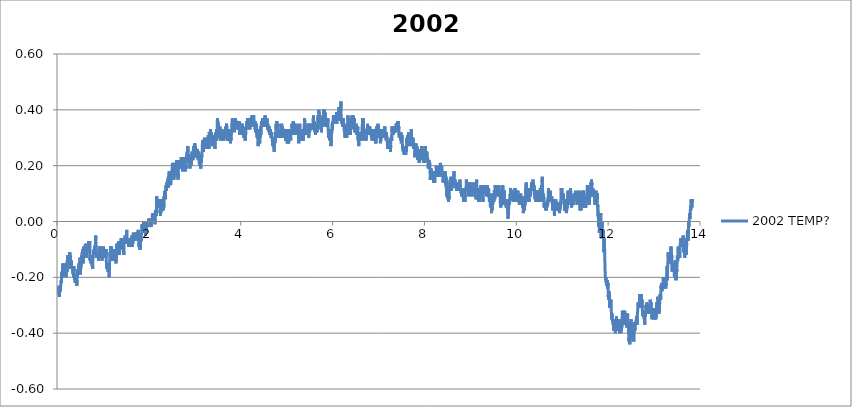
| Category | 2002 TEMP? |
|---|---|
| 0.01620481575 | -0.24 |
| 0.019264157416666667 | -0.25 |
| 0.022323499055555557 | -0.25 |
| 0.025382562916666667 | -0.25 |
| 0.028442737944444445 | -0.24 |
| 0.03150207961111111 | -0.25 |
| 0.03456142125 | -0.26 |
| 0.03762076291666666 | -0.25 |
| 0.040680104555555555 | -0.25 |
| 0.04373944622222222 | -0.23 |
| 0.04679878786111111 | -0.25 |
| 0.04985785172222222 | -0.27 |
| 0.05291747116666667 | -0.26 |
| 0.055977090611111106 | -0.25 |
| 0.05903643225 | -0.24 |
| 0.062096329500000005 | -0.24 |
| 0.0651553933611111 | -0.25 |
| 0.0682155683888889 | -0.24 |
| 0.07127546561111112 | -0.25 |
| 0.07433452947222222 | -0.25 |
| 0.07739387113888889 | -0.25 |
| 0.08045349058333334 | -0.23 |
| 0.08351283222222222 | -0.23 |
| 0.0865721738888889 | -0.23 |
| 0.08963123775 | -0.23 |
| 0.09269085719444445 | -0.21 |
| 0.09575019883333334 | -0.22 |
| 0.09880926269444444 | -0.21 |
| 0.10186999330555556 | -0.19 |
| 0.10492933497222222 | -0.2 |
| 0.10798839880555555 | -0.18 |
| 0.11104774047222221 | -0.19 |
| 0.11410735991666666 | -0.2 |
| 0.11716781274999999 | -0.18 |
| 0.12022715438888888 | -0.19 |
| 0.12328677383333334 | -0.19 |
| 0.12634611547222221 | -0.16 |
| 0.12940545713888887 | -0.15 |
| 0.132464521 | -0.17 |
| 0.13552441822222222 | -0.16 |
| 0.13858375988888888 | -0.18 |
| 0.1416431015277778 | -0.18 |
| 0.14470244319444445 | -0.18 |
| 0.14776178483333335 | -0.16 |
| 0.15082112649999999 | -0.17 |
| 0.15388157930555554 | -0.18 |
| 0.15694064316666667 | -0.17 |
| 0.15999998483333333 | -0.18 |
| 0.1630604376388889 | -0.19 |
| 0.16611977930555558 | -0.17 |
| 0.16917884316666668 | -0.16 |
| 0.17223790700000002 | -0.17 |
| 0.17529752644444443 | -0.16 |
| 0.1783568681111111 | -0.16 |
| 0.18141593197222222 | -0.16 |
| 0.18447527361111113 | -0.15 |
| 0.18753461527777776 | -0.18 |
| 0.1905936791111111 | -0.17 |
| 0.19365274297222224 | -0.16 |
| 0.19671264022222223 | -0.2 |
| 0.19977198186111111 | -0.17 |
| 0.20283104572222224 | -0.15 |
| 0.20589010958333334 | -0.17 |
| 0.20894945125 | -0.18 |
| 0.21200934847222222 | -0.16 |
| 0.21506924572222222 | -0.15 |
| 0.21812969852777778 | -0.18 |
| 0.22118904019444444 | -0.16 |
| 0.22424865963888888 | -0.14 |
| 0.22730800127777778 | -0.15 |
| 0.23036706513888888 | -0.13 |
| 0.23342696238888888 | -0.14 |
| 0.2364863040277778 | -0.13 |
| 0.2395453678888889 | -0.12 |
| 0.24260498733333333 | -0.14 |
| 0.2456643289722222 | -0.14 |
| 0.2487236706388889 | -0.15 |
| 0.2517830122777778 | -0.15 |
| 0.2548429095277778 | -0.14 |
| 0.25790225116666665 | -0.12 |
| 0.2609618706111111 | -0.14 |
| 0.2640209344722222 | -0.14 |
| 0.2670802761388889 | -0.15 |
| 0.27013934 | -0.15 |
| 0.2731992372222222 | -0.14 |
| 0.2762583010833333 | -0.15 |
| 0.27931792052777776 | -0.11 |
| 0.2823772621666667 | -0.14 |
| 0.2854374372222222 | -0.14 |
| 0.2884970566666667 | -0.12 |
| 0.2915566761111111 | -0.12 |
| 0.29461657333333335 | -0.17 |
| 0.2976756371944444 | -0.16 |
| 0.30073497883333333 | -0.14 |
| 0.3037940426944445 | -0.16 |
| 0.3068533843611111 | -0.17 |
| 0.309912726 | -0.14 |
| 0.31297429 | -0.14 |
| 0.31604002091666666 | -0.16 |
| 0.3190996403611111 | -0.16 |
| 0.3221592598055556 | -0.16 |
| 0.32521887925 | -0.16 |
| 0.3282796098611111 | -0.16 |
| 0.3313403404722222 | -0.16 |
| 0.33440023772222227 | -0.17 |
| 0.3374601349722222 | -0.17 |
| 0.34052086558333333 | -0.16 |
| 0.34358131841666667 | -0.18 |
| 0.3466417712222222 | -0.18 |
| 0.3497011128888889 | -0.18 |
| 0.3527632324722222 | -0.19 |
| 0.3558228519166667 | -0.18 |
| 0.35888330475 | -0.19 |
| 0.36194570211111116 | -0.2 |
| 0.36501421097222225 | -0.17 |
| 0.36807605275 | -0.16 |
| 0.37114261705555557 | -0.18 |
| 0.3742025142777778 | -0.19 |
| 0.3772626893055555 | -0.19 |
| 0.38032453111111114 | -0.2 |
| 0.3833844283333333 | -0.19 |
| 0.38644543675 | -0.2 |
| 0.38950700075 | -0.21 |
| 0.3925688425555556 | -0.2 |
| 0.39562985097222225 | -0.21 |
| 0.3986961374722222 | -0.22 |
| 0.40175603469444443 | -0.19 |
| 0.40481593194444443 | -0.2 |
| 0.4078777737222222 | -0.22 |
| 0.41093878213888885 | -0.2 |
| 0.4139986793888889 | -0.21 |
| 0.41705913219444446 | -0.2 |
| 0.42011875163888884 | -0.2 |
| 0.42317809330555556 | -0.21 |
| 0.42623743494444444 | -0.2 |
| 0.4292970543888889 | -0.23 |
| 0.4323566738333333 | -0.23 |
| 0.43541712666666665 | -0.21 |
| 0.43847674611111115 | -0.2 |
| 0.4415388656944444 | -0.19 |
| 0.4445984851388889 | -0.2 |
| 0.44765782680555555 | -0.18 |
| 0.4507188352222222 | -0.19 |
| 0.45378539949999996 | -0.18 |
| 0.4568447411388889 | -0.17 |
| 0.4599040828055555 | -0.17 |
| 0.46296370225 | -0.18 |
| 0.46602415505555556 | -0.17 |
| 0.4690837745 | -0.17 |
| 0.4721433939722222 | -0.16 |
| 0.4752024578055556 | -0.16 |
| 0.4782617994722222 | -0.15 |
| 0.48132225230555553 | -0.18 |
| 0.48438187175 | -0.18 |
| 0.48744093558333335 | -0.17 |
| 0.4905005550277778 | -0.17 |
| 0.49355989669444444 | -0.14 |
| 0.49661896055555554 | -0.14 |
| 0.4996791355833333 | -0.14 |
| 0.5027387550277778 | -0.13 |
| 0.5057980966666666 | -0.16 |
| 0.5088577161111111 | -0.19 |
| 0.5119170577777777 | -0.16 |
| 0.5149763994166666 | -0.17 |
| 0.5180357410833333 | -0.15 |
| 0.5210950827222223 | -0.16 |
| 0.5241549799722222 | -0.14 |
| 0.5272143216111111 | -0.13 |
| 0.5302736632777778 | -0.14 |
| 0.5333330049166667 | -0.12 |
| 0.5363920687777778 | -0.13 |
| 0.5394514104166667 | -0.14 |
| 0.5425110298611111 | -0.13 |
| 0.5455706493055555 | -0.12 |
| 0.5486299909722222 | -0.11 |
| 0.5516904437777778 | -0.11 |
| 0.5547497854444444 | -0.12 |
| 0.5578096826666666 | -0.11 |
| 0.5608693021111111 | -0.1 |
| 0.5639291993611111 | -0.13 |
| 0.5669888188055555 | -0.14 |
| 0.5700489938333333 | -0.15 |
| 0.5731083355 | -0.12 |
| 0.5761676771388888 | -0.11 |
| 0.5792275743888889 | -0.09 |
| 0.5822869160277778 | -0.1 |
| 0.5853487578333333 | -0.1 |
| 0.5884086550555556 | -0.12 |
| 0.5914679967222223 | -0.13 |
| 0.5945273383611112 | -0.12 |
| 0.5975869578055555 | -0.13 |
| 0.60064657725 | -0.11 |
| 0.6037061966944445 | -0.11 |
| 0.6067652605555556 | -0.12 |
| 0.60982488 | -0.1 |
| 0.6128842216388889 | -0.09 |
| 0.6159438410833333 | -0.08 |
| 0.6190029049444444 | -0.08 |
| 0.6220628021944444 | -0.09 |
| 0.6251221438333333 | -0.11 |
| 0.6281820410833333 | -0.09 |
| 0.6312411049444444 | -0.11 |
| 0.634300724388889 | -0.09 |
| 0.6373608994166666 | -0.13 |
| 0.6404199632777777 | -0.11 |
| 0.6434793049166666 | -0.1 |
| 0.6465386465833333 | -0.08 |
| 0.6495990993888889 | -0.08 |
| 0.6526584410555555 | -0.08 |
| 0.6557175049166666 | -0.08 |
| 0.6587768465555556 | -0.09 |
| 0.6618359104166667 | -0.09 |
| 0.6648949742777778 | -0.09 |
| 0.6679545937222223 | -0.1 |
| 0.6710139353611111 | -0.11 |
| 0.6740732770277779 | -0.11 |
| 0.6771323408888889 | -0.11 |
| 0.6801922381111111 | -0.08 |
| 0.6832515797777777 | -0.09 |
| 0.6863109214166666 | -0.07 |
| 0.6893699852777778 | -0.11 |
| 0.6924296047222221 | -0.1 |
| 0.6954892241666667 | -0.09 |
| 0.6985499547777778 | -0.09 |
| 0.7016106854166666 | -0.08 |
| 0.7046700270555555 | -0.11 |
| 0.7077302020833333 | -0.1 |
| 0.7107903771111111 | -0.07 |
| 0.7138497187777778 | -0.11 |
| 0.7169090604166667 | -0.11 |
| 0.7199684020833333 | -0.14 |
| 0.7230277437222222 | -0.12 |
| 0.7260868075833333 | -0.12 |
| 0.7291461492222222 | -0.14 |
| 0.7322060464722222 | -0.13 |
| 0.7352651103333334 | -0.14 |
| 0.7383244519722223 | -0.15 |
| 0.741383793638889 | -0.13 |
| 0.7444439686666667 | -0.14 |
| 0.7475030325277777 | -0.14 |
| 0.7505623741666667 | -0.14 |
| 0.7536222714166667 | -0.15 |
| 0.756681890861111 | -0.15 |
| 0.7597412324999999 | -0.13 |
| 0.7628005741666666 | -0.14 |
| 0.765859638 | -0.13 |
| 0.7689189796666668 | -0.16 |
| 0.7719780435277778 | -0.14 |
| 0.7750371073888889 | -0.17 |
| 0.7780964490277777 | -0.16 |
| 0.7811560684722223 | -0.14 |
| 0.7842151323333333 | -0.13 |
| 0.7872805854444445 | -0.13 |
| 0.7903402048888889 | -0.11 |
| 0.7934001021111111 | -0.11 |
| 0.7964627773055555 | -0.11 |
| 0.7995229523333333 | -0.12 |
| 0.8025836829444445 | -0.12 |
| 0.8056483026944444 | -0.12 |
| 0.8087073665277777 | -0.1 |
| 0.8117678193611111 | -0.11 |
| 0.8148282721944444 | -0.1 |
| 0.8179112263055556 | -0.09 |
| 0.8210047365833334 | -0.1 |
| 0.8240715786666667 | -0.09 |
| 0.8271378651388889 | -0.09 |
| 0.8302341533611111 | -0.09 |
| 0.8332948839722222 | -0.09 |
| 0.8363586703333333 | -0.09 |
| 0.8394296793055556 | -0.08 |
| 0.8424995771111111 | -0.05 |
| 0.8455630856666667 | -0.07 |
| 0.8486377059722222 | -0.07 |
| 0.8517070481944444 | -0.08 |
| 0.8547772238055555 | -0.13 |
| 0.8578462882222223 | -0.13 |
| 0.8609147970833333 | -0.12 |
| 0.8639855282777777 | -0.13 |
| 0.8670629264999999 | -0.12 |
| 0.8701283796111111 | -0.12 |
| 0.8731957772777778 | -0.12 |
| 0.8762559523055555 | -0.11 |
| 0.8793405731944444 | -0.12 |
| 0.882412971138889 | -0.13 |
| 0.8854831467500001 | -0.11 |
| 0.888550266611111 | -0.12 |
| 0.8916207200277778 | -0.13 |
| 0.89468533975 | -0.13 |
| 0.8977502372777778 | -0.12 |
| 0.9008168015555555 | -0.12 |
| 0.9038803101111111 | -0.14 |
| 0.9069743759722222 | -0.12 |
| 0.9100401068888888 | -0.12 |
| 0.9131016708888888 | -0.13 |
| 0.9161707353055556 | -0.13 |
| 0.9192364662222222 | -0.13 |
| 0.9223096975555556 | -0.1 |
| 0.9253823733055555 | -0.11 |
| 0.92844671525 | -0.09 |
| 0.9315141129166666 | -0.1 |
| 0.9346031784722223 | -0.09 |
| 0.93768391025 | -0.11 |
| 0.9407485299722222 | -0.1 |
| 0.9438209279166666 | -0.13 |
| 0.9468924925 | -0.13 |
| 0.9499568344444445 | -0.13 |
| 0.9530231209166666 | -0.11 |
| 0.9560907963888889 | -0.12 |
| 0.9591590274444444 | -0.09 |
| 0.9622339255277779 | -0.11 |
| 0.9653029899722223 | -0.12 |
| 0.9683670541111111 | -0.12 |
| 0.9714330628055556 | -0.12 |
| 0.9744946268055557 | -0.11 |
| 0.9775598021111112 | -0.13 |
| 0.9806277553888889 | -0.14 |
| 0.9836982087777778 | -0.13 |
| 0.9867617173333334 | -0.13 |
| 0.9898296705833333 | -0.12 |
| 0.9929040130833333 | -0.11 |
| 0.9959686328333333 | -0.12 |
| 0.9990457532777778 | -0.12 |
| 1.0021114841666665 | -0.1 |
| 1.0051797152222222 | -0.09 |
| 1.0082732255 | -0.09 |
| 1.0113453456666666 | -0.09 |
| 1.0144141323055555 | -0.09 |
| 1.017506531388889 | -0.1 |
| 1.0205739290555556 | -0.11 |
| 1.0236579943333333 | -0.11 |
| 1.02672372525 | -0.11 |
| 1.029811401861111 | -0.11 |
| 1.032892967 | -0.12 |
| 1.0359750877222222 | -0.1 |
| 1.0390497080277779 | -0.12 |
| 1.0421309953888889 | -0.13 |
| 1.0452078380277778 | -0.13 |
| 1.0482696798333333 | -0.12 |
| 1.0513426333611111 | -0.13 |
| 1.0544441996666667 | -0.11 |
| 1.05753659875 | -0.12 |
| 1.0606017740833333 | -0.1 |
| 1.0636813946666666 | -0.1 |
| 1.0667543481944444 | -0.11 |
| 1.0698203569166667 | -0.1 |
| 1.072900810861111 | -0.13 |
| 1.0759909876111111 | -0.15 |
| 1.079068385861111 | -0.16 |
| 1.0821452285 | -0.15 |
| 1.0852242935 | -0.15 |
| 1.0883314156666666 | -0.17 |
| 1.0913993689166668 | -0.15 |
| 1.0944737114444445 | -0.16 |
| 1.0975466649722223 | -0.15 |
| 1.1006465645 | -0.16 |
| 1.1037395191944444 | -0.16 |
| 1.1068299737222222 | -0.17 |
| 1.1099054274166666 | -0.18 |
| 1.1130056047222223 | -0.16 |
| 1.1160841141388889 | -0.15 |
| 1.1191570676944445 | -0.17 |
| 1.1222719680833333 | -0.18 |
| 1.1253426992777777 | -0.18 |
| 1.1284198197222222 | -0.17 |
| 1.1314986069166666 | -0.18 |
| 1.1345998954166667 | -0.2 |
| 1.1376775714444445 | -0.19 |
| 1.1407677481944445 | -0.17 |
| 1.143864592 | -0.16 |
| 1.1469633803333332 | -0.14 |
| 1.150034667111111 | -0.12 |
| 1.1530981756666667 | -0.11 |
| 1.1561677956944443 | -0.11 |
| 1.1592404714444446 | -0.11 |
| 1.1623070357222223 | -0.12 |
| 1.1653749889722222 | -0.09 |
| 1.1684454423888888 | -0.1 |
| 1.17151728475 | -0.1 |
| 1.1745807933055554 | -0.09 |
| 1.1776495799444446 | -0.1 |
| 1.1807283671388888 | -0.09 |
| 1.183796876 | -0.09 |
| 1.1868745520277777 | -0.09 |
| 1.1899419496944446 | -0.09 |
| 1.1930087917777779 | -0.1 |
| 1.1960803563333333 | -0.1 |
| 1.199141086972222 | -0.1 |
| 1.2022040399166667 | -0.13 |
| 1.2052689374444445 | -0.13 |
| 1.2083402242222223 | -0.13 |
| 1.2114126221944443 | -0.14 |
| 1.2144758529444446 | -0.14 |
| 1.2175410282777777 | -0.12 |
| 1.2206195376666666 | -0.13 |
| 1.2236849907777776 | -0.11 |
| 1.226747110388889 | -0.12 |
| 1.2298114523055557 | -0.14 |
| 1.2328738496944445 | -0.13 |
| 1.2359351359166666 | -0.13 |
| 1.2390130897222222 | -0.13 |
| 1.2420793762222222 | -0.13 |
| 1.2451409402222222 | -0.12 |
| 1.2482086156944443 | -0.13 |
| 1.25127212425 | -0.1 |
| 1.2543372995555557 | -0.12 |
| 1.2574005303333333 | -0.12 |
| 1.2604654278333334 | -0.12 |
| 1.2635375480000002 | -0.13 |
| 1.2666024455277778 | -0.13 |
| 1.2696676208333333 | -0.13 |
| 1.2727280736666666 | -0.11 |
| 1.27579491575 | -0.12 |
| 1.2788553685833333 | -0.12 |
| 1.2819174881666666 | -0.15 |
| 1.2849804411388888 | -0.13 |
| 1.2880447830833333 | -0.14 |
| 1.2911080138333333 | -0.14 |
| 1.2941693000277776 | -0.12 |
| 1.297237808888889 | -0.11 |
| 1.3002988173055554 | -0.08 |
| 1.3033606590833333 | -0.08 |
| 1.3064227786666667 | -0.11 |
| 1.3094862872222222 | -0.11 |
| 1.3125764639722222 | -0.12 |
| 1.315646917388889 | -0.11 |
| 1.3187112593055557 | -0.11 |
| 1.3217733789166666 | -0.11 |
| 1.3248496659722224 | -0.12 |
| 1.3279128967222222 | -0.12 |
| 1.3309814055833333 | -0.12 |
| 1.334059081611111 | -0.09 |
| 1.3371187010555556 | -0.07 |
| 1.34018470975 | -0.09 |
| 1.34324627375 | -0.09 |
| 1.3463556182499998 | -0.08 |
| 1.3494169044722222 | -0.09 |
| 1.3524768016944444 | -0.09 |
| 1.35555447775 | -0.12 |
| 1.358627986861111 | -0.11 |
| 1.3617020515833331 | -0.07 |
| 1.3647708382222221 | -0.08 |
| 1.3678396248611113 | -0.08 |
| 1.370907578111111 | -0.08 |
| 1.373972475638889 | -0.09 |
| 1.3770398733055558 | -0.1 |
| 1.38009949275 | -0.09 |
| 1.3831646680555556 | -0.07 |
| 1.3862278988333332 | -0.08 |
| 1.3892891850277778 | -0.07 |
| 1.392348804472222 | -0.07 |
| 1.395409812888889 | -0.08 |
| 1.39852137975 | -0.06 |
| 1.4015904441666667 | -0.08 |
| 1.4046672868333334 | -0.08 |
| 1.4077335733333334 | -0.07 |
| 1.4108006931944443 | -0.08 |
| 1.41386420175 | -0.07 |
| 1.4169260435555555 | -0.09 |
| 1.419986496361111 | -0.08 |
| 1.4230477825833332 | -0.06 |
| 1.4261240696388888 | -0.08 |
| 1.4291925784722221 | -0.06 |
| 1.432258864972222 | -0.07 |
| 1.4353254292777777 | -0.09 |
| 1.4383958826666667 | -0.09 |
| 1.4414757810555556 | -0.09 |
| 1.4445415119444445 | -0.11 |
| 1.447609743 | -0.12 |
| 1.450673807138889 | -0.11 |
| 1.4537331488055556 | -0.12 |
| 1.4567994352777778 | -0.11 |
| 1.45986238825 | -0.07 |
| 1.462932008277778 | -0.08 |
| 1.4659946834444446 | -0.08 |
| 1.4690679147777779 | -0.08 |
| 1.4721311455555555 | -0.08 |
| 1.4751918761666667 | -0.06 |
| 1.4782526067777777 | -0.06 |
| 1.4813763965555555 | -0.06 |
| 1.4844396273333333 | -0.05 |
| 1.4875009135277777 | -0.06 |
| 1.4905641443055555 | -0.06 |
| 1.4936376534166667 | -0.06 |
| 1.4967033843333333 | -0.07 |
| 1.499776337861111 | -0.06 |
| 1.5028492914166665 | -0.06 |
| 1.505911411 | -0.07 |
| 1.5089813088055555 | -0.07 |
| 1.5120500954444445 | -0.06 |
| 1.5151147151666666 | -0.06 |
| 1.51817683475 | -0.03 |
| 1.5212372875833333 | -0.04 |
| 1.5242988515833333 | -0.04 |
| 1.5273584710277777 | -0.06 |
| 1.5304194794444446 | -0.06 |
| 1.5334807656388887 | -0.06 |
| 1.5365401073055556 | -0.08 |
| 1.5396027824722223 | -0.08 |
| 1.5426624019166666 | -0.06 |
| 1.5457264660555554 | -0.06 |
| 1.5487919191666666 | -0.06 |
| 1.5518590390555556 | -0.07 |
| 1.5549247699444444 | -0.06 |
| 1.5579846671944446 | -0.06 |
| 1.5610467867777778 | -0.09 |
| 1.5641205736944443 | -0.09 |
| 1.5671824155 | -0.08 |
| 1.5702423127222223 | -0.09 |
| 1.5733049879166667 | -0.08 |
| 1.5763643295555554 | -0.08 |
| 1.5794250601666666 | -0.08 |
| 1.5824849574166668 | -0.09 |
| 1.5855451324444445 | -0.09 |
| 1.588609474388889 | -0.09 |
| 1.5916727051388888 | -0.09 |
| 1.5947353803333333 | -0.09 |
| 1.5977974999166669 | -0.09 |
| 1.6008579527500002 | -0.09 |
| 1.6039203501111112 | -0.07 |
| 1.6069816363333334 | -0.09 |
| 1.610041811361111 | -0.09 |
| 1.6131008752222222 | -0.08 |
| 1.616163550388889 | -0.07 |
| 1.6192253921944444 | -0.07 |
| 1.6222955677777777 | -0.06 |
| 1.6253549094444444 | -0.06 |
| 1.6284303631111112 | -0.07 |
| 1.6314899825555556 | -0.05 |
| 1.6345507131944443 | -0.06 |
| 1.6376106104166666 | -0.07 |
| 1.6406707854444444 | -0.09 |
| 1.643730127111111 | -0.07 |
| 1.6467903021388888 | -0.08 |
| 1.6498529773055555 | -0.08 |
| 1.6529128745555555 | -0.08 |
| 1.6559774942777776 | -0.07 |
| 1.65904044725 | -0.05 |
| 1.6621000666944443 | -0.04 |
| 1.6651688533333333 | -0.05 |
| 1.6682365288055556 | -0.06 |
| 1.6713150382222224 | -0.05 |
| 1.6743749354444446 | -0.05 |
| 1.6774356660555554 | -0.06 |
| 1.6804950077222223 | -0.06 |
| 1.6835546271666666 | -0.05 |
| 1.6866184135 | -0.05 |
| 1.6896847 | -0.06 |
| 1.69274459725 | -0.05 |
| 1.6958050500555555 | -0.04 |
| 1.6988666140555557 | -0.07 |
| 1.7019287336666666 | -0.06 |
| 1.7049889086944445 | -0.06 |
| 1.7080493615277779 | -0.05 |
| 1.7111089809722222 | -0.05 |
| 1.714177212 | -0.06 |
| 1.7172376648333334 | -0.04 |
| 1.7202972842777777 | -0.05 |
| 1.723358570472222 | -0.06 |
| 1.7264223568333334 | -0.05 |
| 1.7294839208333332 | -0.04 |
| 1.7325443736666666 | -0.05 |
| 1.7356037153055557 | -0.05 |
| 1.7386691684166666 | -0.05 |
| 1.7417326769722223 | -0.06 |
| 1.7447934076111111 | -0.04 |
| 1.7478541382222224 | -0.05 |
| 1.75091431325 | -0.04 |
| 1.7539739326944443 | -0.04 |
| 1.757035218888889 | -0.04 |
| 1.7600948383333332 | -0.05 |
| 1.763155013388889 | -0.05 |
| 1.766217132972222 | -0.06 |
| 1.7692825860833332 | -0.03 |
| 1.7723613732777777 | -0.06 |
| 1.7754207149444445 | -0.07 |
| 1.7784833901111112 | -0.05 |
| 1.78154745425 | -0.07 |
| 1.7846098516388889 | -0.09 |
| 1.7876769715 | -0.08 |
| 1.7907413134444445 | -0.08 |
| 1.7938050998055557 | -0.08 |
| 1.7968841648055556 | -0.07 |
| 1.7999443398333335 | -0.1 |
| 1.8030042370555557 | -0.09 |
| 1.8060644121111111 | -0.09 |
| 1.8091287540277778 | -0.1 |
| 1.8122169862222222 | -0.09 |
| 1.815276327888889 | -0.07 |
| 1.8183365029166667 | -0.09 |
| 1.82139695575 | -0.07 |
| 1.8244587975277777 | -0.06 |
| 1.8275203615277777 | -0.06 |
| 1.8305805365555554 | -0.07 |
| 1.8336418227777778 | -0.06 |
| 1.8367042201388888 | -0.05 |
| 1.8397696732500002 | -0.05 |
| 1.8428331818055554 | -0.04 |
| 1.8458947458055557 | -0.02 |
| 1.8489554764444445 | -0.02 |
| 1.8520273188055556 | -0.01 |
| 1.855118884527778 | -0.01 |
| 1.8581798929444444 | -0.02 |
| 1.861240067972222 | -0.01 |
| 1.8643007985833333 | -0.01 |
| 1.8673623625833333 | -0.03 |
| 1.8704247599722224 | -0.04 |
| 1.8734918798333333 | -0.04 |
| 1.8765512215 | -0.03 |
| 1.879620008138889 | -0.03 |
| 1.8826857390277778 | -0.03 |
| 1.8857459140555557 | 0 |
| 1.888810256 | 0 |
| 1.8918704310277779 | -0.01 |
| 1.894933384 | -0.02 |
| 1.898012449 | -0.03 |
| 1.901074846388889 | -0.04 |
| 1.9041358548055556 | -0.03 |
| 1.9071982521666668 | -0.04 |
| 1.9102603717777777 | -0.02 |
| 1.913319991222222 | -0.03 |
| 1.9163879444722223 | -0.01 |
| 1.9194481195000002 | -0.02 |
| 1.92250801675 | -0.04 |
| 1.9255712475 | -0.05 |
| 1.9286333670833333 | -0.04 |
| 1.9316988201944443 | -0.03 |
| 1.934759828611111 | -0.02 |
| 1.937819725861111 | -0.03 |
| 1.9408860123333334 | -0.04 |
| 1.9439459095833334 | -0.04 |
| 1.9470099737222222 | -0.01 |
| 1.9500743156666667 | -0.02 |
| 1.9531350462777777 | -0.01 |
| 1.956195776888889 | -0.01 |
| 1.9592559519444444 | -0.02 |
| 1.962317793722222 | 0 |
| 1.9653790799444444 | 0 |
| 1.9684392549722223 | -0.02 |
| 1.97149943 | -0.02 |
| 1.9745584938611112 | 0 |
| 1.9776236691666669 | 0 |
| 1.9806843997777777 | -0.01 |
| 1.9837442970277779 | -0.01 |
| 1.9868041942777779 | 0 |
| 1.9898732586944445 | -0.01 |
| 1.9929409341666666 | 0 |
| 1.9960005536111112 | 0.01 |
| 1.9990648955277779 | -0.02 |
| 2.002144516138889 | -0.01 |
| 2.0052060801388887 | 0 |
| 2.008267644138889 | 0 |
| 2.0113289303333333 | 0.01 |
| 2.0143893831666664 | 0 |
| 2.0174495581944445 | 0 |
| 2.0205094554444445 | -0.01 |
| 2.0235685192777777 | 0 |
| 2.0266411950277776 | 0 |
| 2.0297088705 | 0.01 |
| 2.0327690455277776 | 0 |
| 2.0358292205555557 | 0 |
| 2.0388941180833333 | 0 |
| 2.0419554043055554 | -0.01 |
| 2.0450155793333336 | 0 |
| 2.048078810083333 | 0 |
| 2.0511398185 | -0.02 |
| 2.0542008269166665 | 0 |
| 2.05726127975 | -0.01 |
| 2.0603245105 | 0 |
| 2.0633994085833334 | 0 |
| 2.066459028027778 | 0 |
| 2.069520869833333 | 0 |
| 2.0725807670833336 | 0.01 |
| 2.0756417755 | 0.01 |
| 2.0787013949444444 | 0.03 |
| 2.0817757374444446 | 0.03 |
| 2.084835079083333 | 0 |
| 2.0878991432222223 | 0 |
| 2.0909598738611113 | 0.01 |
| 2.0940203266666666 | 0.01 |
| 2.0970796683333335 | 0.02 |
| 2.1001448436388888 | 0.01 |
| 2.103211963527778 | 0.01 |
| 2.1062874171944443 | 0.01 |
| 2.1093475922500002 | 0.03 |
| 2.1124066560833334 | 0 |
| 2.1154671089166666 | 0.03 |
| 2.1185381179166667 | 0.02 |
| 2.121608849083333 | 0.02 |
| 2.124671246472222 | 0.02 |
| 2.1277330882777776 | 0.03 |
| 2.1308018749166666 | 0.01 |
| 2.133861494361111 | -0.01 |
| 2.1369241695277776 | 0.02 |
| 2.1399865669166664 | 0.03 |
| 2.1430464641388887 | 0.04 |
| 2.1461077503611112 | 0.02 |
| 2.1491698699444446 | 0.02 |
| 2.1522392121666667 | 0.03 |
| 2.1552988316111112 | 0.03 |
| 2.158363729138889 | 0.04 |
| 2.161423070777778 | 0.02 |
| 2.1644824124444444 | 0.05 |
| 2.1675417540833335 | 0.07 |
| 2.17060109575 | 0.09 |
| 2.1736640486944445 | 0.06 |
| 2.1767356132777778 | 0.07 |
| 2.1797946771388887 | 0.07 |
| 2.182861519222222 | 0.08 |
| 2.1859219720555556 | 0.08 |
| 2.1889868695555554 | 0.07 |
| 2.1920492669444442 | 0.06 |
| 2.1951108309444445 | 0.07 |
| 2.198171005972222 | 0.06 |
| 2.201230069833333 | 0.06 |
| 2.2042955229444443 | 0.08 |
| 2.2073562535555555 | 0.06 |
| 2.2104178175555553 | 0.07 |
| 2.213478270388889 | 0.05 |
| 2.216538167638889 | 0.07 |
| 2.219602231777778 | 0.06 |
| 2.222669351638889 | 0.06 |
| 2.2257311934444446 | 0.08 |
| 2.2287916462777777 | 0.05 |
| 2.2318604329166667 | 0.06 |
| 2.2349253304166665 | 0.06 |
| 2.237988283388889 | 0.07 |
| 2.2410590145833336 | 0.06 |
| 2.2441236343333335 | 0.03 |
| 2.2471874206666667 | 0.03 |
| 2.250250095833333 | 0.04 |
| 2.2533113820555557 | 0.02 |
| 2.2563935027777777 | 0.04 |
| 2.2594531222222223 | 0.03 |
| 2.262512741666667 | 0.05 |
| 2.2655765280277778 | 0.06 |
| 2.2686414255555554 | 0.08 |
| 2.2717021561666666 | 0.08 |
| 2.274765664722222 | 0.06 |
| 2.277826117555555 | 0.06 |
| 2.2808943485833333 | 0.07 |
| 2.2839534124444447 | 0.05 |
| 2.2870133096944443 | 0.04 |
| 2.2900918191111113 | 0.05 |
| 2.293151994138889 | 0.05 |
| 2.2962121691666666 | 0.05 |
| 2.299273733166667 | 0.06 |
| 2.3023350193888885 | 0.04 |
| 2.305397138972222 | 0.06 |
| 2.308457314 | 0.04 |
| 2.311521933722222 | 0.07 |
| 2.3145846088888886 | 0.05 |
| 2.3176467285 | 0.05 |
| 2.320706625722222 | 0.07 |
| 2.323765967388889 | 0.05 |
| 2.326838920916667 | 0.06 |
| 2.3299004849166667 | 0.09 |
| 2.3329812166944444 | 0.08 |
| 2.3360458364166665 | 0.08 |
| 2.339108789388889 | 0.08 |
| 2.3421681310277775 | 0.08 |
| 2.3452271948888885 | 0.08 |
| 2.348287647722222 | 0.11 |
| 2.3513536564166664 | 0.11 |
| 2.3544163315833333 | 0.1 |
| 2.3574792845555557 | 0.1 |
| 2.360538626222222 | 0.08 |
| 2.363599634611111 | 0.11 |
| 2.3666606430277777 | 0.11 |
| 2.369723318222222 | 0.12 |
| 2.372783215444444 | 0.13 |
| 2.3758425571111115 | 0.13 |
| 2.3789024543333337 | 0.13 |
| 2.381962073777778 | 0.13 |
| 2.385026137916667 | 0.11 |
| 2.3880935355833333 | 0.13 |
| 2.391153155027778 | 0.12 |
| 2.3942133300833333 | 0.12 |
| 2.3972735051111114 | 0.14 |
| 2.4003334023333336 | 0.12 |
| 2.4033963553055555 | 0.13 |
| 2.406459308277778 | 0.13 |
| 2.409520594472222 | 0.15 |
| 2.412581880694445 | 0.15 |
| 2.4156490005555558 | 0.15 |
| 2.4187138980833334 | 0.14 |
| 2.4217768510555557 | 0.12 |
| 2.4248398040277777 | 0.16 |
| 2.4279216469722225 | 0.16 |
| 2.4309871000833336 | 0.15 |
| 2.434053664361111 | 0.16 |
| 2.4371141171944446 | 0.16 |
| 2.4401745700277777 | 0.17 |
| 2.44323446725 | 0.18 |
| 2.4462965868333333 | 0.16 |
| 2.4493567618611114 | 0.16 |
| 2.452416659111111 | 0.15 |
| 2.455481556638889 | 0.15 |
| 2.4585458985833335 | 0.15 |
| 2.4616049624166667 | 0.16 |
| 2.464685138611111 | 0.15 |
| 2.467746424805555 | 0.14 |
| 2.4708088221944444 | 0.14 |
| 2.4738681638333335 | 0.13 |
| 2.47692917225 | 0.13 |
| 2.479991291833333 | 0.16 |
| 2.4830581339166664 | 0.15 |
| 2.486118031166667 | 0.16 |
| 2.4891829286944445 | 0.15 |
| 2.4922422703333336 | 0.17 |
| 2.4953018897777777 | 0.18 |
| 2.498364287166667 | 0.18 |
| 2.5014277957222224 | 0.17 |
| 2.5044874151666665 | 0.18 |
| 2.507558146361111 | 0.18 |
| 2.5106222105000002 | 0.18 |
| 2.5136826633333333 | 0.21 |
| 2.5167464496666665 | 0.2 |
| 2.519819125416667 | 0.18 |
| 2.5228793004444445 | 0.19 |
| 2.5259411422499998 | 0.19 |
| 2.529001872861111 | 0.19 |
| 2.5320639924444444 | 0.16 |
| 2.5351247230833334 | 0.17 |
| 2.5381907317777777 | 0.18 |
| 2.5412500734166668 | 0.15 |
| 2.5443135819722222 | 0.16 |
| 2.547373757 | 0.18 |
| 2.5504369877777777 | 0.16 |
| 2.5534979961944444 | 0.19 |
| 2.5565581712222225 | 0.21 |
| 2.559621679777778 | 0.17 |
| 2.5626835215833332 | 0.18 |
| 2.565745363361111 | 0.17 |
| 2.5688083163333335 | 0.19 |
| 2.5718687691666666 | 0.18 |
| 2.574928666388889 | 0.17 |
| 2.5779902303888886 | 0.16 |
| 2.581052627777778 | 0.16 |
| 2.584111969416667 | 0.17 |
| 2.587173255638889 | 0.2 |
| 2.5902350974166666 | 0.17 |
| 2.593294439083333 | 0.19 |
| 2.5963573920555554 | 0.17 |
| 2.5994175670833335 | 0.19 |
| 2.6024780199166666 | 0.18 |
| 2.6055404172777776 | 0.22 |
| 2.608600314527778 | 0.19 |
| 2.6116635452777777 | 0.2 |
| 2.6147309429444445 | 0.19 |
| 2.617792229166667 | 0.18 |
| 2.6208579600555555 | 0.18 |
| 2.6239242465555557 | 0.19 |
| 2.626987477333333 | 0.19 |
| 2.6300473745555553 | 0.18 |
| 2.633107827388889 | 0.18 |
| 2.636168002416667 | 0.15 |
| 2.6392351223055552 | 0.17 |
| 2.6422961306944446 | 0.19 |
| 2.6453663063055557 | 0.2 |
| 2.648430092666667 | 0.2 |
| 2.6514911010833333 | 0.19 |
| 2.6545554429999996 | 0.2 |
| 2.65761534025 | 0.2 |
| 2.660674404111111 | 0.22 |
| 2.6637370792777775 | 0.19 |
| 2.6667972543055556 | 0.19 |
| 2.6698574293333333 | 0.19 |
| 2.6729173265833333 | 0.2 |
| 2.6759813907222223 | 0.21 |
| 2.679042676944445 | 0.2 |
| 2.682102574166667 | 0.2 |
| 2.6851688606666664 | 0.2 |
| 2.6882357027499997 | 0.19 |
| 2.691296988944444 | 0.21 |
| 2.6943577195833335 | 0.2 |
| 2.6974228948888888 | 0.2 |
| 2.700486125638889 | 0.2 |
| 2.7035457450833333 | 0.22 |
| 2.7066075868888886 | 0.23 |
| 2.709669150888889 | 0.2 |
| 2.712737104138889 | 0.21 |
| 2.7157995015277776 | 0.2 |
| 2.7188591209722226 | 0.2 |
| 2.7219240184999998 | 0.2 |
| 2.7249933607222223 | 0.2 |
| 2.7280554803055557 | 0.21 |
| 2.7311178776944445 | 0.18 |
| 2.734183886388889 | 0.21 |
| 2.7372443392222223 | 0.23 |
| 2.7403114590833337 | 0.22 |
| 2.7433744120555557 | 0.23 |
| 2.746450699111111 | 0.22 |
| 2.7495136520833334 | 0.22 |
| 2.752575771666667 | 0.22 |
| 2.7556381690555556 | 0.22 |
| 2.7587025109999996 | 0.22 |
| 2.761772964388889 | 0.21 |
| 2.7648325838333334 | 0.21 |
| 2.767893314444444 | 0.23 |
| 2.7709537672777778 | 0.21 |
| 2.7740150535 | 0.2 |
| 2.7770788398333335 | 0.22 |
| 2.780139014861111 | 0.18 |
| 2.783202801222222 | 0.18 |
| 2.7862649208055554 | 0.2 |
| 2.78932454025 | 0.19 |
| 2.7923872154166665 | 0.19 |
| 2.795449057222222 | 0.18 |
| 2.7985172882777776 | 0.18 |
| 2.8015791300555555 | 0.19 |
| 2.804646805527778 | 0.2 |
| 2.8077069805555555 | 0.19 |
| 2.8107702113055555 | 0.22 |
| 2.8138301085555555 | 0.22 |
| 2.8168900058055555 | 0.21 |
| 2.8199532365555555 | 0.22 |
| 2.8230511915277776 | 0.23 |
| 2.826115533472222 | 0.24 |
| 2.8291754306944443 | 0.24 |
| 2.832235050138889 | 0.23 |
| 2.8352988365 | 0.25 |
| 2.838358178138889 | 0.24 |
| 2.8414211311111113 | 0.23 |
| 2.844484361888889 | 0.23 |
| 2.8475573154166662 | 0.27 |
| 2.8506191572222224 | 0.25 |
| 2.853681832388889 | 0.25 |
| 2.8567556193055554 | 0.24 |
| 2.859816627722222 | 0.21 |
| 2.862887358916667 | 0.22 |
| 2.865948089527778 | 0.24 |
| 2.869008542361111 | 0.22 |
| 2.872068717388889 | 0.22 |
| 2.875130836972222 | 0.23 |
| 2.878191012 | 0.23 |
| 2.8812550761666667 | 0.24 |
| 2.8843188625 | 0.23 |
| 2.88737875975 | 0.21 |
| 2.8904522688611114 | 0.23 |
| 2.893512166111111 | 0.21 |
| 2.896572896722222 | 0.19 |
| 2.899634738527778 | 0.21 |
| 2.9027035251666664 | 0.2 |
| 2.9057673115 | 0.21 |
| 2.908830820055556 | 0.21 |
| 2.9118982177222223 | 0.23 |
| 2.9149642264166666 | 0.22 |
| 2.918025790416667 | 0.21 |
| 2.9210898545833333 | 0.2 |
| 2.9241533631388887 | 0.22 |
| 2.927241873111111 | 0.21 |
| 2.930330383111111 | 0.21 |
| 2.933400003111111 | 0.21 |
| 2.936462122694444 | 0.23 |
| 2.9395225755277776 | 0.25 |
| 2.942585806305556 | 0.25 |
| 2.945646259111111 | 0.25 |
| 2.9487106010555553 | 0.23 |
| 2.951780498861111 | 0.25 |
| 2.9548423406666666 | 0.24 |
| 2.9579091827500004 | 0.22 |
| 2.9609715801111114 | 0.22 |
| 2.9640334219166666 | 0.23 |
| 2.967097208277778 | 0.25 |
| 2.9701565499166667 | 0.25 |
| 2.9732195028888886 | 0.27 |
| 2.976280789083333 | 0.26 |
| 2.979340964111111 | 0.24 |
| 2.9824114175277776 | 0.26 |
| 2.985472148138889 | 0.27 |
| 2.9885331565555555 | 0.25 |
| 2.9915936093888886 | 0.27 |
| 2.99465434 | 0.25 |
| 2.997715904 | 0.25 |
| 3.0007771901944444 | 0.28 |
| 3.0038390319999997 | 0.25 |
| 3.006912541138889 | 0.25 |
| 3.0099729939444444 | 0.24 |
| 3.01306511525 | 0.25 |
| 3.016126401472222 | 0.27 |
| 3.0191957436944445 | 0.26 |
| 3.022257029888889 | 0.25 |
| 3.0253180383055556 | 0.24 |
| 3.0283812690555556 | 0.23 |
| 3.0314714458055554 | 0.24 |
| 3.034538010111111 | 0.23 |
| 3.0375970739722225 | 0.25 |
| 3.0406589157500004 | 0.25 |
| 3.043722702111111 | 0.23 |
| 3.046788155222222 | 0.25 |
| 3.0498502748055554 | 0.24 |
| 3.0529096164444445 | 0.25 |
| 3.055970069277778 | 0.26 |
| 3.059034689 | 0.24 |
| 3.0620979197777776 | 0.24 |
| 3.065157539222222 | 0.25 |
| 3.0682213255555557 | 0.23 |
| 3.0712826117777774 | 0.25 |
| 3.0743425089999996 | 0.22 |
| 3.0774051841944443 | 0.24 |
| 3.080468970527778 | 0.23 |
| 3.0835285899722225 | 0.25 |
| 3.0865904317777777 | 0.23 |
| 3.0896522735833334 | 0.22 |
| 3.0927118930277775 | 0.22 |
| 3.095778457305556 | 0.21 |
| 3.09883807675 | 0.21 |
| 3.1019024186944444 | 0.21 |
| 3.1049631493055556 | 0.21 |
| 3.1080244355 | 0.21 |
| 3.111088499638889 | 0.2 |
| 3.1141970107777777 | 0.2 |
| 3.1172574636111112 | 0.21 |
| 3.1203256946666666 | 0.22 |
| 3.123385591888889 | 0.22 |
| 3.126452433972222 | 0.22 |
| 3.1295173315 | 0.19 |
| 3.1325872293055554 | 0.2 |
| 3.135647126555556 | 0.23 |
| 3.1387173021388888 | 0.22 |
| 3.1417769215833333 | 0.21 |
| 3.144836541027778 | 0.23 |
| 3.147896993861111 | 0.24 |
| 3.1509566133055555 | 0.23 |
| 3.1540203996666665 | 0.24 |
| 3.1570811302777777 | 0.24 |
| 3.160141305305556 | 0.25 |
| 3.1632059250555553 | 0.27 |
| 3.1662672112499997 | 0.28 |
| 3.1693387758333333 | 0.29 |
| 3.172400062027778 | 0.28 |
| 3.1754649595555557 | 0.28 |
| 3.1785262457499996 | 0.27 |
| 3.181586143 | 0.28 |
| 3.1846482625833334 | 0.27 |
| 3.1877081598333334 | 0.25 |
| 3.190768612638889 | 0.27 |
| 3.1938343435555554 | 0.26 |
| 3.196922020166667 | 0.28 |
| 3.1999835841666666 | 0.29 |
| 3.203043203611111 | 0.29 |
| 3.206103378638889 | 0.29 |
| 3.209166609388889 | 0.3 |
| 3.212227340027778 | 0.27 |
| 3.2152902930000002 | 0.29 |
| 3.218351857 | 0.29 |
| 3.221413143194445 | 0.27 |
| 3.224473318222222 | 0.27 |
| 3.2275326598888885 | 0.27 |
| 3.23059505725 | 0.26 |
| 3.233660510361111 | 0.26 |
| 3.2367234633333335 | 0.27 |
| 3.2397850273333333 | 0.28 |
| 3.2428479803055557 | 0.27 |
| 3.245908710916667 | 0.28 |
| 3.2489736084444445 | 0.26 |
| 3.2520390615555557 | 0.27 |
| 3.255098403222222 | 0.26 |
| 3.258159411638889 | 0.27 |
| 3.261224031361111 | 0.27 |
| 3.264283650805556 | 0.28 |
| 3.2673541041944443 | 0.3 |
| 3.2704156681944445 | 0.29 |
| 3.2734752876388886 | 0.29 |
| 3.2765354626666667 | 0.28 |
| 3.2796006380000002 | 0.29 |
| 3.2826627575833336 | 0.28 |
| 3.285725710555556 | 0.28 |
| 3.2887911636666662 | 0.27 |
| 3.2918505053055553 | 0.3 |
| 3.294910958138889 | 0.31 |
| 3.29797168875 | 0.28 |
| 3.3010338083333335 | 0.31 |
| 3.304093983388889 | 0.29 |
| 3.3071544361944447 | 0.26 |
| 3.310218222555555 | 0.29 |
| 3.313277842 | 0.29 |
| 3.3163369058611107 | 0.32 |
| 3.31940735925 | 0.31 |
| 3.3224708678055555 | 0.29 |
| 3.3255321540277776 | 0.3 |
| 3.32859205125 | 0.3 |
| 3.331660282305555 | 0.3 |
| 3.3347204573333333 | 0.31 |
| 3.3377842436944447 | 0.32 |
| 3.340844974305556 | 0.33 |
| 3.3439065383055553 | 0.3 |
| 3.3469675467222224 | 0.31 |
| 3.3500274439444446 | 0.31 |
| 3.353092063694444 | 0.31 |
| 3.3561516831388887 | 0.31 |
| 3.3592149138888887 | 0.31 |
| 3.3622753667222223 | 0.32 |
| 3.3653372085 | 0.31 |
| 3.368404328388889 | 0.31 |
| 3.3714656145833337 | 0.3 |
| 3.3745269008055554 | 0.29 |
| 3.3775904093611113 | 0.3 |
| 3.3806500288055554 | 0.27 |
| 3.383715481916667 | 0.28 |
| 3.3867753791388893 | 0.31 |
| 3.389838332111111 | 0.31 |
| 3.392898507138889 | 0.31 |
| 3.395959793361111 | 0.29 |
| 3.399019968388889 | 0.3 |
| 3.402081532388889 | 0.31 |
| 3.405140874027778 | 0.3 |
| 3.408200771277778 | 0.29 |
| 3.411271502472222 | 0.29 |
| 3.414330844111111 | 0.28 |
| 3.4173932415 | 0.28 |
| 3.4204528609444442 | 0.29 |
| 3.4235119248055557 | 0.29 |
| 3.426574322194444 | 0.29 |
| 3.4296411642777773 | 0.29 |
| 3.4327030060555557 | 0.28 |
| 3.435762347722222 | 0.28 |
| 3.438821689361111 | 0.26 |
| 3.441881586611111 | 0.28 |
| 3.44494565075 | 0.28 |
| 3.4480113816388887 | 0.29 |
| 3.4510732234444443 | 0.3 |
| 3.4541331206944443 | 0.29 |
| 3.457193295722222 | 0.3 |
| 3.460254304138889 | 0.32 |
| 3.4633150347500004 | 0.32 |
| 3.4663763209444443 | 0.3 |
| 3.46943816275 | 0.29 |
| 3.4725011157222223 | 0.3 |
| 3.4755612907500004 | 0.33 |
| 3.478621187972222 | 0.33 |
| 3.481682196388889 | 0.31 |
| 3.4847451493611112 | 0.32 |
| 3.48780588 | 0.33 |
| 3.490865221638889 | 0.36 |
| 3.493926230055555 | 0.37 |
| 3.4969880718333335 | 0.33 |
| 3.5000532471666665 | 0.36 |
| 3.5031137 | 0.35 |
| 3.5061758195833335 | 0.35 |
| 3.5092365501944442 | 0.34 |
| 3.5122978363888886 | 0.34 |
| 3.5153605115833333 | 0.35 |
| 3.518420964388889 | 0.32 |
| 3.521493362361111 | 0.33 |
| 3.524552981805556 | 0.32 |
| 3.52761260125 | 0.3 |
| 3.5306802766944445 | 0.32 |
| 3.5337429518888888 | 0.32 |
| 3.536806182638889 | 0.32 |
| 3.5398688578055553 | 0.33 |
| 3.542930699611111 | 0.33 |
| 3.545995041555556 | 0.33 |
| 3.549056049972222 | 0.34 |
| 3.552117058388889 | 0.31 |
| 3.555179177972222 | 0.29 |
| 3.558240186388889 | 0.29 |
| 3.5613003614166665 | 0.32 |
| 3.5643602586388887 | 0.3 |
| 3.567426545138889 | 0.31 |
| 3.5704861645833335 | 0.32 |
| 3.5735460618333335 | 0.32 |
| 3.5766106815555556 | 0.32 |
| 3.5796708565833333 | 0.32 |
| 3.582734642944444 | 0.3 |
| 3.5857953735555554 | 0.32 |
| 3.588856381972222 | 0.31 |
| 3.5919207239166666 | 0.31 |
| 3.5949797877500003 | 0.33 |
| 3.5980566304166666 | 0.32 |
| 3.601117361027778 | 0.32 |
| 3.604180314 | 0.32 |
| 3.6072399334444447 | 0.32 |
| 3.6103034419999998 | 0.31 |
| 3.613364172611111 | 0.29 |
| 3.6164240698611114 | 0.3 |
| 3.6194836893055555 | 0.29 |
| 3.622544697722222 | 0.3 |
| 3.6256070951111115 | 0.3 |
| 3.6286678257222222 | 0.31 |
| 3.6317296674999997 | 0.29 |
| 3.634789009166667 | 0.3 |
| 3.6378483508055552 | 0.31 |
| 3.6409082480555557 | 0.31 |
| 3.6439678675 | 0.3 |
| 3.647029987083333 | 0.3 |
| 3.6500904399166667 | 0.32 |
| 3.653156448611111 | 0.32 |
| 3.65622523525 | 0.31 |
| 3.6592848546944445 | 0.3 |
| 3.6623447519166668 | 0.31 |
| 3.66540520475 | 0.31 |
| 3.6684651020000003 | 0.33 |
| 3.671524999222222 | 0.34 |
| 3.6745846186666666 | 0.34 |
| 3.677643960333333 | 0.32 |
| 3.6807102468055555 | 0.33 |
| 3.683772088611111 | 0.34 |
| 3.686834486 | 0.32 |
| 3.68989605 | 0.32 |
| 3.6929562250277774 | 0.35 |
| 3.6960155666666665 | 0.31 |
| 3.699076297305556 | 0.3 |
| 3.70213591675 | 0.3 |
| 3.7052013698611113 | 0.31 |
| 3.7082607115 | 0.32 |
| 3.711321442111111 | 0.29 |
| 3.7143827283333333 | 0.3 |
| 3.7174470702777778 | 0.3 |
| 3.720507245305556 | 0.29 |
| 3.723571865027778 | 0.31 |
| 3.726631484472222 | 0.3 |
| 3.7296958264166666 | 0.3 |
| 3.732756557027778 | 0.3 |
| 3.73581784325 | 0.29 |
| 3.7388780182777777 | 0.29 |
| 3.74194430475 | 0.31 |
| 3.7450053131666667 | 0.31 |
| 3.7480924341944446 | 0.3 |
| 3.7511520536388887 | 0.31 |
| 3.75421584 | 0.32 |
| 3.7572865711666665 | 0.33 |
| 3.760347024 | 0.32 |
| 3.763411921527778 | 0.29 |
| 3.766472652138889 | 0.29 |
| 3.7695358829166667 | 0.31 |
| 3.7725977246944447 | 0.3 |
| 3.7756615110555556 | 0.28 |
| 3.7787244640277775 | 0.29 |
| 3.781786583611111 | 0.3 |
| 3.784848147611111 | 0.29 |
| 3.7879138785277777 | 0.29 |
| 3.790974609138889 | 0.29 |
| 3.794037284305556 | 0.3 |
| 3.797099126111111 | 0.33 |
| 3.8001773577222226 | 0.31 |
| 3.8032369771666668 | 0.33 |
| 3.80629909675 | 0.35 |
| 3.8093598273888887 | 0.35 |
| 3.812419724611111 | 0.36 |
| 3.8154790662777778 | 0.36 |
| 3.8185400746666662 | 0.37 |
| 3.8216005275 | 0.36 |
| 3.8246598691666667 | 0.35 |
| 3.827727544611111 | 0.34 |
| 3.83081855475 | 0.33 |
| 3.833889563722222 | 0.33 |
| 3.8369494609722223 | 0.36 |
| 3.8400096359999996 | 0.35 |
| 3.8430756446944447 | 0.36 |
| 3.8461444313333333 | 0.35 |
| 3.8492059953333335 | 0.34 |
| 3.8522672815555556 | 0.35 |
| 3.855342735222222 | 0.35 |
| 3.8584040214444446 | 0.34 |
| 3.861464196472222 | 0.33 |
| 3.864523538111111 | 0.32 |
| 3.8675839909444445 | 0.34 |
| 3.870644999361111 | 0.35 |
| 3.873705729972222 | 0.36 |
| 3.876765627222222 | 0.35 |
| 3.8798285801666665 | 0.34 |
| 3.8828887552222224 | 0.36 |
| 3.885950597 | 0.37 |
| 3.8890141055555554 | 0.36 |
| 3.8920748361944444 | 0.35 |
| 3.895134455638889 | 0.33 |
| 3.898197408583333 | 0.34 |
| 3.9012598059722223 | 0.35 |
| 3.904328592611111 | 0.36 |
| 3.9073946013055556 | 0.35 |
| 3.9104578320833334 | 0.36 |
| 3.9135196738611113 | 0.36 |
| 3.916586238166667 | 0.36 |
| 3.9196466909722223 | 0.36 |
| 3.922707699388889 | 0.35 |
| 3.9257673188333335 | 0.34 |
| 3.928829438416667 | 0.36 |
| 3.931899336222222 | 0.36 |
| 3.9349589556666666 | 0.35 |
| 3.9380202418888888 | 0.35 |
| 3.941084306027778 | 0.35 |
| 3.9441447588611114 | 0.33 |
| 3.9472093785833335 | 0.36 |
| 3.950273442722222 | 0.36 |
| 3.953334173361111 | 0.33 |
| 3.9563960151388886 | 0.35 |
| 3.959458412527778 | 0.33 |
| 3.9625213655000002 | 0.36 |
| 3.9655954301944445 | 0.36 |
| 3.968659216555556 | 0.34 |
| 3.971730781138889 | 0.34 |
| 3.9747906783611113 | 0.35 |
| 3.9778502978055554 | 0.31 |
| 3.980910195055556 | 0.33 |
| 3.983970092277778 | 0.33 |
| 3.9870361009999997 | 0.32 |
| 3.990102387472222 | 0.32 |
| 3.993170340722222 | 0.33 |
| 3.9962327381111113 | 0.33 |
| 3.9992945799166666 | 0.31 |
| 4.002361144194444 | 0.31 |
| 4.005422152611112 | 0.35 |
| 4.008481494250001 | 0.33 |
| 4.011541113694444 | 0.33 |
| 4.014607955777778 | 0.33 |
| 4.01767090875 | 0.34 |
| 4.0207344173055555 | 0.32 |
| 4.0237943145555555 | 0.34 |
| 4.026860878833333 | 0.33 |
| 4.029927998722222 | 0.33 |
| 4.032989284916667 | 0.33 |
| 4.036050015527778 | 0.34 |
| 4.039112135111111 | 0.35 |
| 4.042172587944445 | 0.33 |
| 4.045232207388889 | 0.31 |
| 4.0482915490555555 | 0.32 |
| 4.051354502000001 | 0.32 |
| 4.05441439925 | 0.34 |
| 4.05747596325 | 0.34 |
| 4.0605355826944445 | 0.33 |
| 4.063619925777778 | 0.32 |
| 4.066679545222222 | 0.32 |
| 4.06973972025 | 0.3 |
| 4.072799061916666 | 0.3 |
| 4.075863681638889 | 0.3 |
| 4.078925801222222 | 0.32 |
| 4.082001254916666 | 0.33 |
| 4.085068930361111 | 0.3 |
| 4.088132716722222 | 0.31 |
| 4.091193447333334 | 0.31 |
| 4.094259456027777 | 0.32 |
| 4.097321853416667 | 0.29 |
| 4.100388973277777 | 0.3 |
| 4.103451092888889 | 0.32 |
| 4.106526546555556 | 0.31 |
| 4.1095939442222225 | 0.32 |
| 4.112659397333333 | 0.33 |
| 4.115730406333333 | 0.33 |
| 4.118794470472222 | 0.33 |
| 4.121854367694445 | 0.33 |
| 4.124913431555556 | 0.34 |
| 4.127977495722222 | 0.35 |
| 4.13103767075 | 0.36 |
| 4.134102568277778 | 0.35 |
| 4.137162187722222 | 0.35 |
| 4.140225418472222 | 0.35 |
| 4.143287815861111 | 0.33 |
| 4.146348824277778 | 0.35 |
| 4.149415388555555 | 0.36 |
| 4.1524780637222225 | 0.37 |
| 4.155540738888889 | 0.35 |
| 4.15860452525 | 0.37 |
| 4.161664700277777 | 0.37 |
| 4.164750987916666 | 0.37 |
| 4.16781144075 | 0.37 |
| 4.170872449166667 | 0.37 |
| 4.173934846527778 | 0.37 |
| 4.17699613275 | 0.36 |
| 4.180058807916667 | 0.35 |
| 4.183126205583333 | 0.35 |
| 4.186186658416667 | 0.37 |
| 4.189246277861111 | 0.36 |
| 4.192306730694445 | 0.35 |
| 4.195366072333333 | 0.36 |
| 4.198430136472222 | 0.33 |
| 4.2014997565000005 | 0.35 |
| 4.204565765194444 | 0.35 |
| 4.207629551555556 | 0.36 |
| 4.210689171 | 0.35 |
| 4.2137490682222225 | 0.35 |
| 4.216816743694444 | 0.37 |
| 4.2198771965277775 | 0.37 |
| 4.222939593888889 | 0.36 |
| 4.22599865775 | 0.36 |
| 4.2290582771944445 | 0.35 |
| 4.232119841194444 | 0.36 |
| 4.235185572111111 | 0.36 |
| 4.238246024916666 | 0.35 |
| 4.241305644361111 | 0.36 |
| 4.244365263805555 | 0.38 |
| 4.2474407175 | 0.37 |
| 4.250501170333333 | 0.34 |
| 4.253564956666667 | 0.35 |
| 4.256625965083333 | 0.36 |
| 4.259685862333334 | 0.37 |
| 4.262747981916667 | 0.36 |
| 4.265810934888889 | 0.35 |
| 4.268870276527777 | 0.35 |
| 4.271932118333334 | 0.38 |
| 4.274999516 | 0.37 |
| 4.2780610800000005 | 0.37 |
| 4.2811245885555556 | 0.38 |
| 4.284186430361111 | 0.36 |
| 4.287253828027778 | 0.35 |
| 4.290319281138888 | 0.36 |
| 4.293379456166667 | 0.36 |
| 4.296444075888889 | 0.36 |
| 4.299509251194444 | 0.36 |
| 4.302568870666667 | 0.36 |
| 4.305639601833334 | 0.35 |
| 4.308699776888889 | 0.35 |
| 4.3117655077777775 | 0.36 |
| 4.314828182944445 | 0.33 |
| 4.317896414 | 0.34 |
| 4.32095631125 | 0.34 |
| 4.324016764055556 | 0.33 |
| 4.327081661583334 | 0.35 |
| 4.330143503388888 | 0.32 |
| 4.333205900777778 | 0.32 |
| 4.336268575944445 | 0.35 |
| 4.33933041775 | 0.32 |
| 4.342390037194445 | 0.34 |
| 4.345452712361111 | 0.33 |
| 4.3485262214722225 | 0.33 |
| 4.351588341083334 | 0.31 |
| 4.354648238305556 | 0.31 |
| 4.35771258025 | 0.3 |
| 4.360775811 | 0.32 |
| 4.3638365416388885 | 0.33 |
| 4.3668989389999995 | 0.3 |
| 4.369961891972222 | 0.3 |
| 4.373027345083333 | 0.3 |
| 4.376086964527778 | 0.29 |
| 4.379148528527778 | 0.27 |
| 4.382208147972222 | 0.27 |
| 4.3852686008055555 | 0.29 |
| 4.388329609222222 | 0.28 |
| 4.391395340138889 | 0.29 |
| 4.3944577375 | 0.29 |
| 4.397522635027777 | 0.28 |
| 4.400588921527778 | 0.28 |
| 4.4036518745 | 0.3 |
| 4.4067214945 | 0.31 |
| 4.4097836140833335 | 0.29 |
| 4.412845733694445 | 0.28 |
| 4.41591729825 | 0.3 |
| 4.418976639916667 | 0.31 |
| 4.422037370527778 | 0.31 |
| 4.425097267777778 | 0.3 |
| 4.428156887222222 | 0.32 |
| 4.431216228861111 | 0.31 |
| 4.434279459611111 | 0.34 |
| 4.4373385234722225 | 0.31 |
| 4.440399809694445 | 0.33 |
| 4.443462207055556 | 0.33 |
| 4.446523771055555 | 0.34 |
| 4.4495833905 | 0.35 |
| 4.45264328775 | 0.36 |
| 4.455704018361111 | 0.35 |
| 4.458763915611112 | 0.35 |
| 4.461826035194445 | 0.36 |
| 4.464885376861111 | 0.36 |
| 4.467945829666666 | 0.36 |
| 4.471008227055555 | 0.36 |
| 4.474069235472222 | 0.35 |
| 4.4771294105 | 0.35 |
| 4.480190418916666 | 0.37 |
| 4.483250038361111 | 0.35 |
| 4.486310213388889 | 0.34 |
| 4.489372055194444 | 0.36 |
| 4.492433896972222 | 0.36 |
| 4.495494349805556 | 0.36 |
| 4.498559247333334 | 0.36 |
| 4.5016222003055555 | 0.35 |
| 4.504687931194445 | 0.35 |
| 4.507752828722222 | 0.36 |
| 4.5108132815555555 | 0.34 |
| 4.513878734666666 | 0.35 |
| 4.5169402986666665 | 0.36 |
| 4.5200043628055555 | 0.36 |
| 4.523065093416666 | 0.37 |
| 4.5261277686111105 | 0.36 |
| 4.529188499222222 | 0.36 |
| 4.532247840861111 | 0.38 |
| 4.535309127083333 | 0.36 |
| 4.538370413277778 | 0.37 |
| 4.5414305883055555 | 0.36 |
| 4.544494096861111 | 0.35 |
| 4.547570383944445 | 0.37 |
| 4.550630003388889 | 0.37 |
| 4.553703512499999 | 0.34 |
| 4.556766465472222 | 0.35 |
| 4.559828029472222 | 0.35 |
| 4.562887926722222 | 0.34 |
| 4.565951435277778 | 0.34 |
| 4.569012443694444 | 0.35 |
| 4.572079841361111 | 0.37 |
| 4.575143627694445 | 0.35 |
| 4.578207414055556 | 0.35 |
| 4.581277867444444 | 0.34 |
| 4.584342764972222 | 0.33 |
| 4.587404051194444 | 0.35 |
| 4.59047089325 | 0.34 |
| 4.593530512694445 | 0.34 |
| 4.596593187888889 | 0.33 |
| 4.599656418638888 | 0.33 |
| 4.6027174270555555 | 0.34 |
| 4.605782324583333 | 0.34 |
| 4.608847222111111 | 0.33 |
| 4.6119085083055555 | 0.33 |
| 4.614975072611111 | 0.32 |
| 4.618035247638889 | 0.33 |
| 4.621094867083333 | 0.33 |
| 4.624158931222222 | 0.33 |
| 4.627219939638889 | 0.34 |
| 4.630289837444444 | 0.31 |
| 4.633350845861111 | 0.33 |
| 4.636411298694444 | 0.32 |
| 4.639478696361111 | 0.31 |
| 4.642543038277778 | 0.33 |
| 4.645609324777778 | 0.33 |
| 4.648674222305556 | 0.31 |
| 4.651740786583333 | 0.32 |
| 4.654800683833334 | 0.32 |
| 4.657861970027778 | 0.31 |
| 4.660926034166667 | 0.3 |
| 4.663986487 | 0.31 |
| 4.667048050999999 | 0.32 |
| 4.670107392666667 | 0.31 |
| 4.6731664565 | 0.32 |
| 4.676237187694444 | 0.31 |
| 4.679297640527778 | 0.31 |
| 4.6823617046666675 | 0.3 |
| 4.685423268666667 | 0.3 |
| 4.688482610333334 | 0.29 |
| 4.691545007694445 | 0.29 |
| 4.694607682888889 | 0.3 |
| 4.697670635861112 | 0.3 |
| 4.700730810888889 | 0.27 |
| 4.703792097083333 | 0.29 |
| 4.7068525499166665 | 0.29 |
| 4.709914113916667 | 0.27 |
| 4.712973455555556 | 0.3 |
| 4.716033352805556 | 0.27 |
| 4.7190971391388885 | 0.27 |
| 4.722157314194444 | 0.27 |
| 4.725238879333333 | 0.26 |
| 4.728300721111111 | 0.25 |
| 4.731369785555556 | 0.29 |
| 4.7344341275 | 0.29 |
| 4.737495135888889 | 0.29 |
| 4.740555310944444 | 0.29 |
| 4.7436185416944445 | 0.28 |
| 4.746679272305555 | 0.28 |
| 4.749740558527778 | 0.3 |
| 4.7528049004722215 | 0.29 |
| 4.7558672978333325 | 0.3 |
| 4.758926917277778 | 0.31 |
| 4.761988481277777 | 0.32 |
| 4.765049489694444 | 0.31 |
| 4.768114387222222 | 0.32 |
| 4.771175117833333 | 0.35 |
| 4.774235292861111 | 0.33 |
| 4.777297690249999 | 0.34 |
| 4.780361198805555 | 0.34 |
| 4.783424985166667 | 0.36 |
| 4.78648710475 | 0.34 |
| 4.7895472797777785 | 0.32 |
| 4.792607732611112 | 0.33 |
| 4.795670407777777 | 0.33 |
| 4.798729749444444 | 0.33 |
| 4.801791313444444 | 0.35 |
| 4.80485648875 | 0.35 |
| 4.807926664361111 | 0.34 |
| 4.810988783944444 | 0.35 |
| 4.814053125888889 | 0.33 |
| 4.817116356638889 | 0.31 |
| 4.820179309611111 | 0.32 |
| 4.823255596666667 | 0.33 |
| 4.826323272138889 | 0.3 |
| 4.829392614361112 | 0.3 |
| 4.832451956000001 | 0.32 |
| 4.83552046486111 | 0.3 |
| 4.838611752777778 | 0.3 |
| 4.841675539111111 | 0.31 |
| 4.844736547527778 | 0.31 |
| 4.84779783375 | 0.32 |
| 4.850857175388889 | 0.33 |
| 4.853916517055556 | 0.33 |
| 4.856975858694445 | 0.32 |
| 4.860034922555555 | 0.31 |
| 4.863101209055555 | 0.3 |
| 4.866167773333333 | 0.3 |
| 4.869231281888888 | 0.31 |
| 4.872294790444444 | 0.3 |
| 4.875355521055555 | 0.33 |
| 4.878415973888889 | 0.33 |
| 4.881477260083334 | 0.32 |
| 4.8845368795277775 | 0.31 |
| 4.887598443527778 | 0.32 |
| 4.890660007555556 | 0.35 |
| 4.893719904777778 | 0.34 |
| 4.896780079805556 | 0.34 |
| 4.899846366305556 | 0.34 |
| 4.902908208111111 | 0.32 |
| 4.905967827555556 | 0.33 |
| 4.909028558166667 | 0.34 |
| 4.912089011 | 0.34 |
| 4.915150297194444 | 0.33 |
| 4.918210472222222 | 0.32 |
| 4.92127759211111 | 0.3 |
| 4.9243386005 | 0.31 |
| 4.927398219972223 | 0.32 |
| 4.930459506166667 | 0.33 |
| 4.933519125611111 | 0.33 |
| 4.936578189472223 | 0.33 |
| 4.939639475666667 | 0.32 |
| 4.9427040954166666 | 0.33 |
| 4.94576315925 | 0.32 |
| 4.94882388988889 | 0.33 |
| 4.951887120638889 | 0.31 |
| 4.954948962444444 | 0.32 |
| 4.958011915416667 | 0.33 |
| 4.9610709792500005 | 0.33 |
| 4.9641350434166664 | 0.32 |
| 4.96719882975 | 0.31 |
| 4.970259004777779 | 0.31 |
| 4.973318624222222 | 0.32 |
| 4.976392133361111 | 0.29 |
| 4.979452308388889 | 0.3 |
| 4.982514983555555 | 0.32 |
| 4.985574880805555 | 0.3 |
| 4.9886358892222225 | 0.32 |
| 4.991696619833333 | 0.3 |
| 4.994756794861111 | 0.33 |
| 4.997816136527778 | 0.3 |
| 5.0008763115555555 | 0.31 |
| 5.003937875555555 | 0.29 |
| 5.006997217194444 | 0.31 |
| 5.010057947833333 | 0.32 |
| 5.013125067694444 | 0.28 |
| 5.0161860761111114 | 0.28 |
| 5.019249029083333 | 0.28 |
| 5.022308926305556 | 0.3 |
| 5.025374379416666 | 0.29 |
| 5.028433721083333 | 0.29 |
| 5.031496674055556 | 0.28 |
| 5.0345562935 | 0.32 |
| 5.037621468805555 | 0.29 |
| 5.040681366055556 | 0.29 |
| 5.043740707694445 | 0.28 |
| 5.046800049361111 | 0.3 |
| 5.049860779972222 | 0.3 |
| 5.052920954999999 | 0.3 |
| 5.055986408111111 | 0.3 |
| 5.059052416805556 | 0.32 |
| 5.062116203166667 | 0.31 |
| 5.065176933777778 | 0.33 |
| 5.06823822 | 0.32 |
| 5.071298395027777 | 0.33 |
| 5.07435884786111 | 0.32 |
| 5.077421800805555 | 0.32 |
| 5.080485864972222 | 0.33 |
| 5.083547151166666 | 0.31 |
| 5.086607604 | 0.29 |
| 5.089668334611111 | 0.3 |
| 5.092728231861112 | 0.31 |
| 5.095788129083333 | 0.32 |
| 5.098853582194445 | 0.32 |
| 5.101917924138889 | 0.31 |
| 5.104978099166667 | 0.33 |
| 5.108039107583333 | 0.31 |
| 5.111099838194444 | 0.32 |
| 5.114168624833333 | 0.33 |
| 5.117234911333334 | 0.35 |
| 5.120294252972222 | 0.33 |
| 5.123368039888889 | 0.32 |
| 5.126427659333333 | 0.33 |
| 5.129490056722222 | 0.32 |
| 5.132549398388889 | 0.33 |
| 5.135613184722222 | 0.33 |
| 5.138675026527777 | 0.33 |
| 5.1417379795 | 0.34 |
| 5.144797598944444 | 0.36 |
| 5.147858329555556 | 0.31 |
| 5.150919337972223 | 0.31 |
| 5.153978957416666 | 0.33 |
| 5.157038021277778 | 0.32 |
| 5.160102085416667 | 0.34 |
| 5.1631722610277775 | 0.35 |
| 5.166231602666667 | 0.34 |
| 5.169291222111112 | 0.34 |
| 5.172351397138889 | 0.34 |
| 5.1754126833611105 | 0.33 |
| 5.178484247916666 | 0.34 |
| 5.181550256611112 | 0.34 |
| 5.184612376222223 | 0.33 |
| 5.187671717861112 | 0.32 |
| 5.1907313373055555 | 0.32 |
| 5.193790401166667 | 0.33 |
| 5.196854465305556 | 0.33 |
| 5.199921029583333 | 0.32 |
| 5.202983426972223 | 0.34 |
| 5.206043601999999 | 0.34 |
| 5.209104888222223 | 0.34 |
| 5.212165618833334 | 0.35 |
| 5.21523134975 | 0.33 |
| 5.218291246972222 | 0.33 |
| 5.221351699805556 | 0.31 |
| 5.224412430416667 | 0.32 |
| 5.2274720498611105 | 0.32 |
| 5.230532224888889 | 0.33 |
| 5.233592122138889 | 0.34 |
| 5.236652574972222 | 0.33 |
| 5.239729139833334 | 0.34 |
| 5.242792092777777 | 0.34 |
| 5.245856156944444 | 0.33 |
| 5.24892133225 | 0.34 |
| 5.251982062861111 | 0.31 |
| 5.2550433490833335 | 0.32 |
| 5.2581057464444445 | 0.31 |
| 5.2611650881111105 | 0.31 |
| 5.264232207972222 | 0.28 |
| 5.267292383027778 | 0.32 |
| 5.270352002472222 | 0.32 |
| 5.273412455277778 | 0.31 |
| 5.276471796944445 | 0.32 |
| 5.279531416388888 | 0.33 |
| 5.282592980388889 | 0.33 |
| 5.285662878194445 | 0.35 |
| 5.2887374985 | 0.32 |
| 5.291797951333334 | 0.3 |
| 5.294859515333333 | 0.33 |
| 5.297921912694444 | 0.32 |
| 5.300982643333334 | 0.33 |
| 5.304042540555555 | 0.33 |
| 5.307110216027778 | 0.31 |
| 5.310170946638889 | 0.33 |
| 5.313231955055555 | 0.29 |
| 5.316296297 | 0.3 |
| 5.319355360833333 | 0.29 |
| 5.322414702500001 | 0.3 |
| 5.325475433111111 | 0.29 |
| 5.328539219472223 | 0.3 |
| 5.331600783472222 | 0.31 |
| 5.334660125111111 | 0.29 |
| 5.337720855750001 | 0.29 |
| 5.34078241975 | 0.3 |
| 5.343845928305555 | 0.3 |
| 5.3469138815555555 | 0.31 |
| 5.349983223777778 | 0.31 |
| 5.353043398805555 | 0.32 |
| 5.356118019111111 | 0.32 |
| 5.35918208325 | 0.32 |
| 5.3622514254722216 | 0.29 |
| 5.365317434166666 | 0.33 |
| 5.3683826095 | 0.32 |
| 5.371441951138889 | 0.33 |
| 5.374501292777778 | 0.33 |
| 5.37756091225 | 0.32 |
| 5.380622198444445 | 0.32 |
| 5.383681817888888 | 0.34 |
| 5.386744770861111 | 0.35 |
| 5.389806612638889 | 0.37 |
| 5.392867343277778 | 0.37 |
| 5.3959286294722215 | 0.35 |
| 5.398990193472223 | 0.33 |
| 5.4020503685 | 0.34 |
| 5.4051119325 | 0.34 |
| 5.4081718297500005 | 0.33 |
| 5.411232560361111 | 0.32 |
| 5.414291902027777 | 0.32 |
| 5.41735179925 | 0.34 |
| 5.420412807666667 | 0.31 |
| 5.423479927555555 | 0.31 |
| 5.426540935944444 | 0.32 |
| 5.429603611138889 | 0.31 |
| 5.432663786166667 | 0.31 |
| 5.43572368338889 | 0.32 |
| 5.438785525194445 | 0.32 |
| 5.441847644777778 | 0.32 |
| 5.444908653194444 | 0.31 |
| 5.447969106027777 | 0.31 |
| 5.451029836638889 | 0.31 |
| 5.454091400638889 | 0.31 |
| 5.457155187000001 | 0.32 |
| 5.460214806444444 | 0.33 |
| 5.463274703666667 | 0.35 |
| 5.466335989888889 | 0.34 |
| 5.469395887111111 | 0.35 |
| 5.472467173888889 | 0.35 |
| 5.475529849083333 | 0.33 |
| 5.4785914130833335 | 0.32 |
| 5.481656032805556 | 0.3 |
| 5.4847167634166665 | 0.31 |
| 5.48777721625 | 0.31 |
| 5.490839891416667 | 0.33 |
| 5.493900622055556 | 0.34 |
| 5.496970797638889 | 0.33 |
| 5.500029861500001 | 0.32 |
| 5.503089480944444 | 0.32 |
| 5.5061552118611115 | 0.33 |
| 5.509222331722222 | 0.34 |
| 5.51229195175 | 0.34 |
| 5.5153551825 | 0.34 |
| 5.518416746500001 | 0.34 |
| 5.521483310805555 | 0.34 |
| 5.524543763611111 | 0.35 |
| 5.527603938638888 | 0.33 |
| 5.530663835888889 | 0.34 |
| 5.533725399888889 | 0.33 |
| 5.536785297138889 | 0.33 |
| 5.53985075025 | 0.33 |
| 5.5429153699722225 | 0.33 |
| 5.545983323222222 | 0.33 |
| 5.549049054138889 | 0.34 |
| 5.55211450725 | 0.34 |
| 5.555173848888889 | 0.35 |
| 5.558235690694444 | 0.35 |
| 5.561295587916667 | 0.33 |
| 5.5643568741388885 | 0.34 |
| 5.567421771666667 | 0.34 |
| 5.570481113305555 | 0.35 |
| 5.573541010555556 | 0.34 |
| 5.576600352194445 | 0.35 |
| 5.579659971638889 | 0.34 |
| 5.582720424472222 | 0.38 |
| 5.5857800439166665 | 0.35 |
| 5.588839385555556 | 0.36 |
| 5.591900116194444 | 0.33 |
| 5.594966402666667 | 0.34 |
| 5.598037411666667 | 0.35 |
| 5.601097308888889 | 0.36 |
| 5.604161650833333 | 0.35 |
| 5.607221270277778 | 0.34 |
| 5.610287834555556 | 0.35 |
| 5.613353009888889 | 0.34 |
| 5.616419851972222 | 0.35 |
| 5.619479193611111 | 0.32 |
| 5.622542702166666 | 0.33 |
| 5.625603710583333 | 0.32 |
| 5.628668885888889 | 0.31 |
| 5.631730449888889 | 0.32 |
| 5.634794514055556 | 0.33 |
| 5.637856911416667 | 0.35 |
| 5.6409165308611104 | 0.34 |
| 5.643975872527777 | 0.33 |
| 5.647052437388889 | 0.32 |
| 5.65011705711111 | 0.32 |
| 5.653176398749999 | 0.32 |
| 5.656240185111111 | 0.32 |
| 5.65929952675 | 0.35 |
| 5.662359424 | 0.33 |
| 5.665419876833333 | 0.32 |
| 5.668488107888888 | 0.33 |
| 5.671548005111111 | 0.33 |
| 5.6746106802777785 | 0.35 |
| 5.677672244277778 | 0.35 |
| 5.680731585944445 | 0.36 |
| 5.683796483472222 | 0.38 |
| 5.686858325249999 | 0.36 |
| 5.6899182225 | 0.37 |
| 5.6929775641388884 | 0.36 |
| 5.696037461388889 | 0.37 |
| 5.6990979142222224 | 0.4 |
| 5.702159756 | 0.4 |
| 5.705221875583333 | 0.4 |
| 5.708282328416667 | 0.4 |
| 5.711351392861111 | 0.4 |
| 5.7144112900833335 | 0.4 |
| 5.7174722985 | 0.38 |
| 5.720531640138889 | 0.37 |
| 5.723597926638889 | 0.36 |
| 5.726657268305556 | 0.35 |
| 5.7297174433333335 | 0.36 |
| 5.732777896138889 | 0.36 |
| 5.7358427936666665 | 0.37 |
| 5.7389110247222215 | 0.36 |
| 5.741970921972222 | 0.34 |
| 5.745031097 | 0.33 |
| 5.7481026615555555 | 0.33 |
| 5.751162003222222 | 0.33 |
| 5.754223844999999 | 0.35 |
| 5.7572865201944445 | 0.32 |
| 5.760346973 | 0.33 |
| 5.763406314666667 | 0.36 |
| 5.766470101 | 0.35 |
| 5.769530831638889 | 0.34 |
| 5.772593784611112 | 0.36 |
| 5.775661460055555 | 0.36 |
| 5.778723579638888 | 0.34 |
| 5.781783199083334 | 0.36 |
| 5.784851152361111 | 0.35 |
| 5.787911049583333 | 0.37 |
| 5.790970669027778 | 0.37 |
| 5.794030010694445 | 0.38 |
| 5.797092408055556 | 0.36 |
| 5.800152305305556 | 0.36 |
| 5.803216091666666 | 0.4 |
| 5.806275433305555 | 0.38 |
| 5.8093367195 | 0.39 |
| 5.812402172611112 | 0.38 |
| 5.815463736611111 | 0.4 |
| 5.818524745027778 | 0.38 |
| 5.821590475944444 | 0.39 |
| 5.824649539805556 | 0.4 |
| 5.827711937166667 | 0.37 |
| 5.830772945583334 | 0.38 |
| 5.833833953999999 | 0.38 |
| 5.836895240222223 | 0.38 |
| 5.8399554152499995 | 0.39 |
| 5.843014756888889 | 0.39 |
| 5.846076320888889 | 0.38 |
| 5.849135384749999 | 0.37 |
| 5.852196670972223 | 0.37 |
| 5.85527823611111 | 0.34 |
| 5.8583895251666664 | 0.36 |
| 5.861494424972221 | 0.34 |
| 5.865041572305556 | 0.35 |
| 5.868103691888889 | 0.34 |
| 5.871199146722223 | 0.35 |
| 5.8742645998333325 | 0.36 |
| 5.877326441638889 | 0.35 |
| 5.880390505777777 | 0.34 |
| 5.883451236388889 | 0.36 |
| 5.886515300527778 | 0.36 |
| 5.889579920277777 | 0.36 |
| 5.892641206472222 | 0.35 |
| 5.895702492694444 | 0.37 |
| 5.898774057250001 | 0.36 |
| 5.901842566111111 | 0.34 |
| 5.904904130111111 | 0.34 |
| 5.907971249972222 | 0.32 |
| 5.911033091777778 | 0.32 |
| 5.914097155916667 | 0.3 |
| 5.917157886527778 | 0.32 |
| 5.920250007833333 | 0.32 |
| 5.923311294027777 | 0.33 |
| 5.926372580250001 | 0.33 |
| 5.929435255416666 | 0.32 |
| 5.932495152666667 | 0.3 |
| 5.935556161083333 | 0.3 |
| 5.938646893416666 | 0.31 |
| 5.9417173468055555 | 0.29 |
| 5.944780021972222 | 0.3 |
| 5.9478396414166665 | 0.32 |
| 5.950902872194445 | 0.33 |
| 5.953968880888889 | 0.32 |
| 5.957035167388889 | 0.32 |
| 5.960096453583334 | 0.33 |
| 5.963157462 | 0.29 |
| 5.966216803638889 | 0.27 |
| 5.9692775342777775 | 0.27 |
| 5.972344098555556 | 0.3 |
| 5.975404829166667 | 0.31 |
| 5.978468337722222 | 0.31 |
| 5.981530179527778 | 0.31 |
| 5.984600632916667 | 0.32 |
| 5.987664697055555 | 0.33 |
| 5.990725149888888 | 0.34 |
| 5.993791714166667 | 0.35 |
| 5.996862723166667 | 0.33 |
| 5.999927342888888 | 0.36 |
| 6.00298640675 | 0.35 |
| 6.006046859583333 | 0.36 |
| 6.009110923722222 | 0.35 |
| 6.012194988999999 | 0.36 |
| 6.015262942250001 | 0.36 |
| 6.018324784055555 | 0.38 |
| 6.0213857924722225 | 0.38 |
| 6.024445689694445 | 0.37 |
| 6.027506142527778 | 0.37 |
| 6.030568539916667 | 0.38 |
| 6.0336303816944445 | 0.36 |
| 6.036690001138889 | 0.36 |
| 6.039751009555555 | 0.36 |
| 6.042836463833333 | 0.36 |
| 6.045907472805555 | 0.38 |
| 6.048974037083333 | 0.36 |
| 6.05203337875 | 0.37 |
| 6.055093275972222 | 0.38 |
| 6.058152895416667 | 0.38 |
| 6.061213070472222 | 0.36 |
| 6.064274078861112 | 0.37 |
| 6.067334253916667 | 0.37 |
| 6.070394151138889 | 0.37 |
| 6.073453215 | 0.38 |
| 6.076517834722222 | 0.38 |
| 6.079578565361111 | 0.38 |
| 6.082640684944445 | 0.36 |
| 6.085706138055556 | 0.39 |
| 6.088771035583333 | 0.35 |
| 6.091831766194445 | 0.38 |
| 6.094896663722222 | 0.37 |
| 6.097961005666667 | 0.37 |
| 6.101028125527778 | 0.39 |
| 6.104091356277777 | 0.36 |
| 6.107150697944445 | 0.36 |
| 6.110214484277778 | 0.38 |
| 6.113276881666666 | 0.39 |
| 6.1163428903611115 | 0.37 |
| 6.119403898777778 | 0.37 |
| 6.122511020944445 | 0.38 |
| 6.12558341888889 | 0.39 |
| 6.128643871722223 | 0.38 |
| 6.13170404675 | 0.37 |
| 6.1347767225 | 0.38 |
| 6.137839953277778 | 0.38 |
| 6.140899294916666 | 0.41 |
| 6.143959192166667 | 0.37 |
| 6.147031034527778 | 0.4 |
| 6.150090376166666 | 0.38 |
| 6.153151384583333 | 0.38 |
| 6.156232671944444 | 0.36 |
| 6.159293402555556 | 0.38 |
| 6.1623566333055555 | 0.39 |
| 6.165418752916667 | 0.39 |
| 6.168479205722222 | 0.4 |
| 6.1715388251666665 | 0.4 |
| 6.174599000194444 | 0.41 |
| 6.1776655645 | 0.41 |
| 6.180726572916667 | 0.43 |
| 6.183788970277778 | 0.4 |
| 6.186851089888889 | 0.38 |
| 6.189911542694444 | 0.38 |
| 6.192972273333334 | 0.37 |
| 6.196037448638889 | 0.36 |
| 6.199097623666667 | 0.36 |
| 6.202160854444444 | 0.36 |
| 6.205223529611111 | 0.35 |
| 6.208287593750001 | 0.35 |
| 6.211349435555555 | 0.36 |
| 6.214413221888889 | 0.35 |
| 6.217477841638889 | 0.34 |
| 6.220548572805556 | 0.34 |
| 6.223623193111111 | 0.35 |
| 6.226683368138889 | 0.36 |
| 6.229745209944444 | 0.35 |
| 6.232851498722223 | 0.36 |
| 6.235925007861111 | 0.37 |
| 6.239037130305556 | 0.34 |
| 6.242104250166667 | 0.35 |
| 6.245166091972223 | 0.34 |
| 6.248225433611111 | 0.34 |
| 6.251285886444445 | 0.34 |
| 6.2543468948611105 | 0.35 |
| 6.257411236805556 | 0.32 |
| 6.260473634166667 | 0.33 |
| 6.2635426986111105 | 0.33 |
| 6.266602595833334 | 0.34 |
| 6.269662215277777 | 0.32 |
| 6.272726557222223 | 0.3 |
| 6.275786454472222 | 0.32 |
| 6.278846907277778 | 0.31 |
| 6.281907915694444 | 0.31 |
| 6.2849753133611115 | 0.3 |
| 6.288035488416667 | 0.31 |
| 6.2910951078611115 | 0.32 |
| 6.294157227444445 | 0.31 |
| 6.29721768025 | 0.32 |
| 6.300277855305556 | 0.33 |
| 6.30334080825 | 0.32 |
| 6.306401261083333 | 0.32 |
| 6.309463658472222 | 0.3 |
| 6.3125266114444445 | 0.32 |
| 6.315586230888888 | 0.31 |
| 6.3186541841388895 | 0.33 |
| 6.321715470333333 | 0.31 |
| 6.32477647875 | 0.34 |
| 6.327839153944444 | 0.33 |
| 6.330920996861111 | 0.35 |
| 6.333980338527778 | 0.37 |
| 6.3370446804444445 | 0.38 |
| 6.340107911222223 | 0.35 |
| 6.343172253166666 | 0.35 |
| 6.346233817166667 | 0.35 |
| 6.3492951033611105 | 0.35 |
| 6.352355833972222 | 0.37 |
| 6.355422398277778 | 0.37 |
| 6.358483128888889 | 0.35 |
| 6.36154691525 | 0.35 |
| 6.364615701861111 | 0.33 |
| 6.367679766027778 | 0.33 |
| 6.37075633088889 | 0.33 |
| 6.373816783694445 | 0.33 |
| 6.376878903277778 | 0.32 |
| 6.379942689638889 | 0.33 |
| 6.383006753777777 | 0.33 |
| 6.3860663732222225 | 0.33 |
| 6.389140715722222 | 0.31 |
| 6.392206168861111 | 0.34 |
| 6.395265788305556 | 0.35 |
| 6.398325963333334 | 0.35 |
| 6.401385582777778 | 0.35 |
| 6.404447424555555 | 0.35 |
| 6.407507321805555 | 0.34 |
| 6.4105672190277785 | 0.34 |
| 6.413627394083334 | 0.36 |
| 6.416687291305555 | 0.36 |
| 6.419748299722222 | 0.36 |
| 6.422807919166667 | 0.35 |
| 6.425871427722223 | 0.38 |
| 6.4289310471666665 | 0.36 |
| 6.431995389111111 | 0.36 |
| 6.435057786500001 | 0.35 |
| 6.438122961805556 | 0.35 |
| 6.441184525805555 | 0.35 |
| 6.444254145833333 | 0.34 |
| 6.447337655527778 | 0.35 |
| 6.450399775111111 | 0.38 |
| 6.453461894694445 | 0.35 |
| 6.4565237365 | 0.35 |
| 6.459588634027778 | 0.33 |
| 6.462649920222223 | 0.34 |
| 6.465716762305556 | 0.36 |
| 6.468777215138889 | 0.36 |
| 6.471840723694444 | 0.37 |
| 6.474900065333333 | 0.34 |
| 6.477963296083333 | 0.34 |
| 6.481023193333334 | 0.34 |
| 6.484083368361111 | 0.32 |
| 6.487142987805555 | 0.33 |
| 6.490203996222222 | 0.32 |
| 6.493274171833334 | 0.33 |
| 6.496333235694444 | 0.33 |
| 6.499392577333333 | 0.33 |
| 6.502461363972222 | 0.32 |
| 6.505521261222222 | 0.32 |
| 6.508588103277778 | 0.34 |
| 6.511661334638889 | 0.33 |
| 6.514743177555556 | 0.34 |
| 6.517803630388889 | 0.35 |
| 6.520866305555555 | 0.32 |
| 6.523927036194444 | 0.32 |
| 6.526989433555555 | 0.31 |
| 6.530049053000001 | 0.31 |
| 6.53311283936111 | 0.31 |
| 6.536183848333334 | 0.31 |
| 6.539244856750001 | 0.32 |
| 6.542305031777778 | 0.32 |
| 6.545371318277778 | 0.33 |
| 6.548431493305555 | 0.34 |
| 6.551503057888889 | 0.31 |
| 6.554564066305556 | 0.31 |
| 6.557626463666667 | 0.29 |
| 6.560686360916666 | 0.32 |
| 6.56374681375 | 0.31 |
| 6.566807266583333 | 0.31 |
| 6.5698704973333335 | 0.27 |
| 6.572933172500001 | 0.29 |
| 6.575999181194445 | 0.29 |
| 6.5790632453611115 | 0.31 |
| 6.582123142583333 | 0.32 |
| 6.585187206722222 | 0.29 |
| 6.5882521042499995 | 0.32 |
| 6.591318112944444 | 0.29 |
| 6.594378288 | 0.3 |
| 6.597453463888889 | 0.3 |
| 6.600513083333333 | 0.31 |
| 6.603574369527778 | 0.29 |
| 6.606635100138889 | 0.29 |
| 6.609694997388889 | 0.29 |
| 6.612760728277777 | 0.31 |
| 6.615821181111111 | 0.31 |
| 6.618883856305556 | 0.29 |
| 6.621958476583334 | 0.31 |
| 6.62501781825 | 0.31 |
| 6.628077715472222 | 0.31 |
| 6.631140390666667 | 0.3 |
| 6.634206399361111 | 0.31 |
| 6.6372679633611105 | 0.32 |
| 6.640328416194444 | 0.32 |
| 6.643387757833333 | 0.34 |
| 6.646463211527778 | 0.34 |
| 6.649526442277778 | 0.35 |
| 6.652586061722222 | 0.32 |
| 6.655645403388888 | 0.35 |
| 6.658709745305555 | 0.37 |
| 6.661772142694445 | 0.35 |
| 6.66485315225 | 0.37 |
| 6.667913882861111 | 0.35 |
| 6.670974057916666 | 0.36 |
| 6.674033399555555 | 0.34 |
| 6.677093296805555 | 0.33 |
| 6.680153194027778 | 0.33 |
| 6.683216980388889 | 0.32 |
| 6.686281044527777 | 0.32 |
| 6.68934094175 | 0.29 |
| 6.692408061638889 | 0.32 |
| 6.695478237250001 | 0.33 |
| 6.698538967861111 | 0.3 |
| 6.701601643027778 | 0.3 |
| 6.704662651444445 | 0.31 |
| 6.707726715583334 | 0.33 |
| 6.710788001805556 | 0.3 |
| 6.713850399166667 | 0.31 |
| 6.716910574222222 | 0.33 |
| 6.719971860416667 | 0.33 |
| 6.723032868833333 | 0.31 |
| 6.726093043861112 | 0.32 |
| 6.729157108000001 | 0.29 |
| 6.73222089436111 | 0.32 |
| 6.7352807915833335 | 0.3 |
| 6.738342355583333 | 0.31 |
| 6.741402808416666 | 0.31 |
| 6.744462150083334 | 0.31 |
| 6.747542881833333 | 0.31 |
| 6.750602501277778 | 0.32 |
| 6.753665732027778 | 0.32 |
| 6.756728685000001 | 0.33 |
| 6.759788304444444 | 0.35 |
| 6.762853201972223 | 0.35 |
| 6.765915599361111 | 0.34 |
| 6.7689779967499994 | 0.34 |
| 6.77203956075 | 0.34 |
| 6.775101958111111 | 0.32 |
| 6.77816268875 | 0.31 |
| 6.781222030388889 | 0.33 |
| 6.7842830388055555 | 0.31 |
| 6.787345158388889 | 0.32 |
| 6.7904058890000005 | 0.33 |
| 6.7934652306666665 | 0.32 |
| 6.796539017583333 | 0.33 |
| 6.799599192611111 | 0.33 |
| 6.8026610344166665 | 0.32 |
| 6.805720653861111 | 0.32 |
| 6.808781384472223 | 0.34 |
| 6.8118421150833335 | 0.32 |
| 6.814904512472222 | 0.32 |
| 6.8179677432500005 | 0.32 |
| 6.821030418416667 | 0.33 |
| 6.824098649472223 | 0.33 |
| 6.8271588245 | 0.32 |
| 6.830218999527777 | 0.31 |
| 6.833282785888889 | 0.32 |
| 6.836342127527778 | 0.32 |
| 6.839407580638889 | 0.32 |
| 6.8424680334722225 | 0.31 |
| 6.8455309864444445 | 0.3 |
| 6.848601717611111 | 0.32 |
| 6.8516621704444445 | 0.31 |
| 6.854721512111111 | 0.3 |
| 6.857782242722223 | 0.29 |
| 6.860841306583334 | 0.32 |
| 6.863901203805556 | 0.31 |
| 6.866963045611111 | 0.31 |
| 6.870023220638888 | 0.31 |
| 6.873090618305556 | 0.32 |
| 6.876156071416666 | 0.31 |
| 6.879224858055556 | 0.32 |
| 6.8822858664722215 | 0.31 |
| 6.885351041777779 | 0.31 |
| 6.888411494611112 | 0.33 |
| 6.891476947722222 | 0.33 |
| 6.894538511722223 | 0.32 |
| 6.897598131166667 | 0.31 |
| 6.900658861777777 | 0.32 |
| 6.903718203444444 | 0.32 |
| 6.906777267305555 | 0.29 |
| 6.90983688675 | 0.29 |
| 6.912898172944444 | 0.29 |
| 6.915969737527778 | 0.29 |
| 6.919031023722223 | 0.3 |
| 6.9220942545 | 0.31 |
| 6.925154429527778 | 0.3 |
| 6.92821432675 | 0.3 |
| 6.931273668416666 | 0.29 |
| 6.934339954916667 | 0.28 |
| 6.937402630083333 | 0.3 |
| 6.940463082916666 | 0.29 |
| 6.943523257944444 | 0.28 |
| 6.9465914889722225 | 0.32 |
| 6.949660275611111 | 0.32 |
| 6.952726562111111 | 0.31 |
| 6.9557889595 | 0.33 |
| 6.958848578944444 | 0.34 |
| 6.961911254111111 | 0.34 |
| 6.964970873555556 | 0.33 |
| 6.968030770805555 | 0.34 |
| 6.971093168166666 | 0.33 |
| 6.974153898805556 | 0.3 |
| 6.977217129555555 | 0.32 |
| 6.980293416638888 | 0.34 |
| 6.983355536222222 | 0.33 |
| 6.9864184891944445 | 0.34 |
| 6.989481719944444 | 0.35 |
| 6.992548562027777 | 0.35 |
| 6.9956095704444445 | 0.35 |
| 6.998674467972222 | 0.32 |
| 7.001735754166667 | 0.34 |
| 7.004795651416667 | 0.31 |
| 7.007856104222222 | 0.31 |
| 7.010915723666667 | 0.32 |
| 7.0139770098888885 | 0.32 |
| 7.0170377405 | 0.32 |
| 7.020097082166667 | 0.31 |
| 7.023158646166666 | 0.32 |
| 7.026218265611112 | 0.33 |
| 7.029280107388889 | 0.31 |
| 7.03235194975 | 0.31 |
| 7.0354137915555555 | 0.3 |
| 7.038474244388889 | 0.3 |
| 7.041533308222222 | 0.28 |
| 7.044593483277778 | 0.3 |
| 7.047654491666667 | 0.29 |
| 7.0507149445 | 0.29 |
| 7.053776786305556 | 0.3 |
| 7.0568452951388885 | 0.31 |
| 7.059907136944444 | 0.3 |
| 7.062970367694445 | 0.32 |
| 7.066033876250001 | 0.31 |
| 7.069097384805556 | 0.32 |
| 7.072158115416666 | 0.32 |
| 7.075225235305556 | 0.33 |
| 7.078286243722222 | 0.33 |
| 7.081354196972223 | 0.33 |
| 7.084413260833334 | 0.32 |
| 7.0874731580555554 | 0.32 |
| 7.090533610888889 | 0.32 |
| 7.093599619583333 | 0.32 |
| 7.096659239027778 | 0.33 |
| 7.099723025388888 | 0.33 |
| 7.102785422777778 | 0.3 |
| 7.105849209111111 | 0.33 |
| 7.108909384138888 | 0.32 |
| 7.111968725805555 | 0.32 |
| 7.115028900833333 | 0.33 |
| 7.11808990925 | 0.33 |
| 7.121151473249999 | 0.33 |
| 7.1242113704722225 | 0.32 |
| 7.127271545527778 | 0.33 |
| 7.130364500194444 | 0.32 |
| 7.133429953305555 | 0.3 |
| 7.136489294972222 | 0.34 |
| 7.139550581166667 | 0.31 |
| 7.142609645027778 | 0.31 |
| 7.145669542277778 | 0.31 |
| 7.148738606694445 | 0.31 |
| 7.151804337611111 | 0.3 |
| 7.15486367925 | 0.31 |
| 7.157925243249999 | 0.32 |
| 7.160988474 | 0.31 |
| 7.164048093444444 | 0.3 |
| 7.16710993525 | 0.29 |
| 7.1701737216111106 | 0.3 |
| 7.173233896638889 | 0.32 |
| 7.1762960162222225 | 0.31 |
| 7.179359802583334 | 0.31 |
| 7.182421088777778 | 0.31 |
| 7.185483763944444 | 0.31 |
| 7.1885469947222225 | 0.3 |
| 7.191608280916667 | 0.29 |
| 7.194668178166666 | 0.29 |
| 7.197730575527777 | 0.26 |
| 7.200790750583333 | 0.28 |
| 7.203851759 | 0.28 |
| 7.206913878583333 | 0.29 |
| 7.209975164777777 | 0.28 |
| 7.21303561761111 | 0.27 |
| 7.216099403944445 | 0.27 |
| 7.2191590233888885 | 0.26 |
| 7.222219754027778 | 0.28 |
| 7.225279373472222 | 0.27 |
| 7.228342604222222 | 0.26 |
| 7.231405001611112 | 0.28 |
| 7.234464621055555 | 0.26 |
| 7.237526462833334 | 0.27 |
| 7.24058747125 | 0.28 |
| 7.243647924083334 | 0.27 |
| 7.246710043666666 | 0.27 |
| 7.249771052083333 | 0.28 |
| 7.252834560638889 | 0.28 |
| 7.255898902583334 | 0.28 |
| 7.258959911 | 0.27 |
| 7.262021197194445 | 0.25 |
| 7.265093595138889 | 0.27 |
| 7.2681529368055555 | 0.29 |
| 7.27121255625 | 0.3 |
| 7.2742724535 | 0.29 |
| 7.277331795138889 | 0.29 |
| 7.280392247972222 | 0.3 |
| 7.28345408975 | 0.31 |
| 7.286513431416667 | 0.29 |
| 7.289575551 | 0.31 |
| 7.29263878175 | 0.32 |
| 7.295698401194445 | 0.34 |
| 7.298763298722222 | 0.32 |
| 7.301828474055555 | 0.33 |
| 7.304888926861111 | 0.32 |
| 7.3079488241111115 | 0.32 |
| 7.311008999138889 | 0.31 |
| 7.314068340805556 | 0.31 |
| 7.317128515833334 | 0.32 |
| 7.320188968638889 | 0.34 |
| 7.3232496992777785 | 0.32 |
| 7.3263115410555555 | 0.31 |
| 7.329372271694445 | 0.33 |
| 7.332432168916666 | 0.32 |
| 7.335492899527778 | 0.33 |
| 7.338556963694445 | 0.32 |
| 7.341616860916666 | 0.33 |
| 7.344678424916667 | 0.32 |
| 7.347741100083333 | 0.33 |
| 7.350805997611111 | 0.33 |
| 7.353865894861111 | 0.32 |
| 7.3569605163055565 | 0.33 |
| 7.360022635888889 | 0.34 |
| 7.363090033555555 | 0.34 |
| 7.366150208583333 | 0.34 |
| 7.3692151061111115 | 0.33 |
| 7.372274725555555 | 0.32 |
| 7.375339067500001 | 0.32 |
| 7.378400909305555 | 0.34 |
| 7.381478029749999 | 0.34 |
| 7.384538482555556 | 0.33 |
| 7.3876019911111115 | 0.35 |
| 7.390661610555555 | 0.34 |
| 7.393723174555555 | 0.35 |
| 7.396782794 | 0.35 |
| 7.399852969611111 | 0.34 |
| 7.402914255833334 | 0.34 |
| 7.405976931 | 0.35 |
| 7.409036272638889 | 0.34 |
| 7.4121017257499995 | 0.35 |
| 7.415162456388889 | 0.35 |
| 7.418224575972222 | 0.36 |
| 7.421286973333333 | 0.34 |
| 7.424346592805556 | 0.35 |
| 7.427405934444445 | 0.36 |
| 7.430468054027777 | 0.35 |
| 7.433529062444444 | 0.34 |
| 7.43659090425 | 0.33 |
| 7.439651079277778 | 0.34 |
| 7.442712643277778 | 0.34 |
| 7.445785041222222 | 0.31 |
| 7.448844938472222 | 0.31 |
| 7.451907613638888 | 0.3 |
| 7.454967788666666 | 0.3 |
| 7.458027408111111 | 0.3 |
| 7.461088972111111 | 0.3 |
| 7.464150536111111 | 0.3 |
| 7.467216544805555 | 0.31 |
| 7.470277275444444 | 0.31 |
| 7.473339395027778 | 0.31 |
| 7.476402625777778 | 0.32 |
| 7.479461967444444 | 0.31 |
| 7.4825235314444445 | 0.29 |
| 7.485582873083333 | 0.32 |
| 7.488648326194444 | 0.32 |
| 7.491711834749999 | 0.32 |
| 7.4947728431666665 | 0.3 |
| 7.497836073916666 | 0.28 |
| 7.500897915722223 | 0.31 |
| 7.503958368555556 | 0.3 |
| 7.507019932555556 | 0.29 |
| 7.510079274194444 | 0.31 |
| 7.513138893638889 | 0.3 |
| 7.516199346472222 | 0.29 |
| 7.519262299444445 | 0.29 |
| 7.522322196666666 | 0.27 |
| 7.5253818161111115 | 0.26 |
| 7.528441157777778 | 0.26 |
| 7.5315057775 | 0.27 |
| 7.534569008277778 | 0.26 |
| 7.537628627722222 | 0.25 |
| 7.540688247166666 | 0.25 |
| 7.543748144388889 | 0.27 |
| 7.546808041638888 | 0.27 |
| 7.549869883416667 | 0.25 |
| 7.552935892111111 | 0.26 |
| 7.55599662275 | 0.26 |
| 7.559061798055556 | 0.24 |
| 7.5621211397222226 | 0.26 |
| 7.565182148111111 | 0.27 |
| 7.568245378888889 | 0.26 |
| 7.571308609638889 | 0.27 |
| 7.574367951305556 | 0.25 |
| 7.577431182055555 | 0.24 |
| 7.58049469061111 | 0.24 |
| 7.583554865638889 | 0.26 |
| 7.586615040694444 | 0.24 |
| 7.589689660972222 | 0.25 |
| 7.592750113805556 | 0.24 |
| 7.5958108444166665 | 0.25 |
| 7.59887601975 | 0.27 |
| 7.601935639194445 | 0.26 |
| 7.604996092027778 | 0.26 |
| 7.608057100444444 | 0.27 |
| 7.611117831055555 | 0.25 |
| 7.614180784027778 | 0.29 |
| 7.617240403472222 | 0.28 |
| 7.620305300999999 | 0.3 |
| 7.623367976166667 | 0.3 |
| 7.626427873388889 | 0.3 |
| 7.629494715472222 | 0.3 |
| 7.632559613 | 0.28 |
| 7.635623399361111 | 0.3 |
| 7.638684129972223 | 0.29 |
| 7.641745138388888 | 0.31 |
| 7.644810313694445 | 0.28 |
| 7.6478718776944445 | 0.3 |
| 7.65093205275 | 0.3 |
| 7.654001117166667 | 0.31 |
| 7.657070459388889 | 0.32 |
| 7.660130912222222 | 0.31 |
| 7.663196087527777 | 0.29 |
| 7.666255984777778 | 0.32 |
| 7.66931893775 | 0.29 |
| 7.672378279388889 | 0.27 |
| 7.675437621055556 | 0.28 |
| 7.678497518277777 | 0.31 |
| 7.6815607490555555 | 0.29 |
| 7.684620646277778 | 0.3 |
| 7.687679987944445 | 0.32 |
| 7.690739885166667 | 0.32 |
| 7.693799782416666 | 0.31 |
| 7.696862457583333 | 0.31 |
| 7.699930410833333 | 0.3 |
| 7.702990030277777 | 0.3 |
| 7.7060510386944445 | 0.3 |
| 7.709114269472222 | 0.3 |
| 7.712181944916667 | 0.31 |
| 7.715242397750001 | 0.33 |
| 7.718304239527778 | 0.31 |
| 7.721364136777778 | 0.31 |
| 7.724431256666667 | 0.29 |
| 7.727495598583333 | 0.29 |
| 7.730554662444445 | 0.29 |
| 7.733619004388888 | 0.28 |
| 7.736681679555556 | 0.28 |
| 7.739745743694445 | 0.28 |
| 7.742806474333333 | 0.27 |
| 7.745866371555556 | 0.27 |
| 7.748929046722223 | 0.28 |
| 7.751988388388889 | 0.3 |
| 7.755047730027778 | 0.29 |
| 7.7581137387500005 | 0.27 |
| 7.76117863625 | 0.27 |
| 7.76426714625 | 0.26 |
| 7.767328432444445 | 0.28 |
| 7.770388885277778 | 0.27 |
| 7.773449893694444 | 0.27 |
| 7.776513957833333 | 0.28 |
| 7.779575799638889 | 0.26 |
| 7.782636252444445 | 0.26 |
| 7.785696983083333 | 0.27 |
| 7.78875965825 | 0.26 |
| 7.791822889 | 0.23 |
| 7.794883341833333 | 0.23 |
| 7.797944628055555 | 0.23 |
| 7.80100591425 | 0.25 |
| 7.804066367083334 | 0.24 |
| 7.807130431222222 | 0.26 |
| 7.810191161833333 | 0.26 |
| 7.813256059361112 | 0.28 |
| 7.816322068055555 | 0.27 |
| 7.819382798694445 | 0.25 |
| 7.822444640472222 | 0.27 |
| 7.825507315638889 | 0.26 |
| 7.828567212888888 | 0.27 |
| 7.8316265545277775 | 0.26 |
| 7.8346958967499996 | 0.27 |
| 7.837755516194444 | 0.26 |
| 7.840815969027778 | 0.25 |
| 7.843875310694445 | 0.25 |
| 7.846936596888889 | 0.24 |
| 7.849999272055555 | 0.25 |
| 7.853064447388888 | 0.25 |
| 7.8561243446111115 | 0.24 |
| 7.8591836862777775 | 0.22 |
| 7.862247472611111 | 0.24 |
| 7.865310981166666 | 0.22 |
| 7.8683753231111115 | 0.25 |
| 7.871438276083333 | 0.25 |
| 7.874497895527778 | 0.26 |
| 7.877556959388889 | 0.23 |
| 7.880625468222222 | 0.22 |
| 7.883685365472222 | 0.23 |
| 7.886750540777777 | 0.21 |
| 7.889848773555556 | 0.23 |
| 7.892909781972222 | 0.21 |
| 7.895974123888889 | 0.22 |
| 7.899037632444444 | 0.22 |
| 7.9020978075 | 0.23 |
| 7.905157149138889 | 0.22 |
| 7.908219268722222 | 0.22 |
| 7.911279165972222 | 0.23 |
| 7.914353786277777 | 0.25 |
| 7.917414794666667 | 0.24 |
| 7.920474969722222 | 0.24 |
| 7.923553479138889 | 0.25 |
| 7.926625599277778 | 0.23 |
| 7.929690496805556 | 0.23 |
| 7.932769006222222 | 0.23 |
| 7.935828903472222 | 0.25 |
| 7.938890467472222 | 0.25 |
| 7.941953698222222 | 0.27 |
| 7.945014706638888 | 0.27 |
| 7.948084604444445 | 0.24 |
| 7.951148946388889 | 0.24 |
| 7.954216621833334 | 0.25 |
| 7.9572809637777775 | 0.25 |
| 7.960340027638889 | 0.26 |
| 7.963402980611112 | 0.25 |
| 7.9664637112222225 | 0.24 |
| 7.969524719638889 | 0.25 |
| 7.9726101738888895 | 0.24 |
| 7.975673404666667 | 0.22 |
| 7.978733857472222 | 0.24 |
| 7.981794865888889 | 0.24 |
| 7.984856707694445 | 0.23 |
| 7.98792021625 | 0.21 |
| 7.990984558194444 | 0.22 |
| 7.994045011000001 | 0.22 |
| 7.997111019722222 | 0.21 |
| 8.000172583722222 | 0.24 |
| 8.003232480944444 | 0.24 |
| 8.006292378194445 | 0.23 |
| 8.009358109083333 | 0.25 |
| 8.01241828411111 | 0.26 |
| 8.015482626055556 | 0.27 |
| 8.01854780138889 | 0.24 |
| 8.02161019875 | 0.25 |
| 8.02467231836111 | 0.23 |
| 8.02773166 | 0.24 |
| 8.030807113694445 | 0.25 |
| 8.033866455333333 | 0.25 |
| 8.036930241694444 | 0.24 |
| 8.039990416722222 | 0.23 |
| 8.043063925833334 | 0.25 |
| 8.046123545277778 | 0.25 |
| 8.049185942666666 | 0.24 |
| 8.052253340333333 | 0.25 |
| 8.055313237583333 | 0.23 |
| 8.058374246 | 0.23 |
| 8.061436365583333 | 0.23 |
| 8.064497651777778 | 0.22 |
| 8.067558382388889 | 0.23 |
| 8.070627446833333 | 0.23 |
| 8.073695677888889 | 0.23 |
| 8.076759742027777 | 0.21 |
| 8.079827417472222 | 0.2 |
| 8.082888981472223 | 0.19 |
| 8.085961935027777 | 0.19 |
| 8.089026554750001 | 0.19 |
| 8.092085896416666 | 0.21 |
| 8.095147182611111 | 0.21 |
| 8.09820958 | 0.22 |
| 8.101268921638889 | 0.22 |
| 8.10432881888889 | 0.21 |
| 8.107392605222222 | 0.19 |
| 8.110452502472222 | 0.19 |
| 8.113515733222222 | 0.21 |
| 8.116575908277778 | 0.2 |
| 8.119643028138888 | 0.2 |
| 8.122710148 | 0.18 |
| 8.125770878638889 | 0.16 |
| 8.12883244263889 | 0.15 |
| 8.131893451055555 | 0.18 |
| 8.134952792694444 | 0.19 |
| 8.138012689944444 | 0.17 |
| 8.141073420555555 | 0.18 |
| 8.14413304 | 0.19 |
| 8.147195159583333 | 0.18 |
| 8.15025450125 | 0.18 |
| 8.153318009805556 | 0.18 |
| 8.156385407472222 | 0.17 |
| 8.159446138083332 | 0.18 |
| 8.16250631311111 | 0.18 |
| 8.16556565475 | 0.18 |
| 8.168624996416666 | 0.15 |
| 8.171685171444445 | 0.16 |
| 8.174750902361112 | 0.16 |
| 8.177815799888888 | 0.15 |
| 8.180885975472222 | 0.17 |
| 8.183948928444444 | 0.16 |
| 8.187011603611111 | 0.17 |
| 8.190073445416667 | 0.16 |
| 8.193138898527778 | 0.16 |
| 8.196201573694443 | 0.15 |
| 8.199261470944444 | 0.14 |
| 8.202323034944444 | 0.15 |
| 8.205395432888889 | 0.15 |
| 8.208458108083333 | 0.14 |
| 8.211517171916666 | 0.14 |
| 8.21457845813889 | 0.17 |
| 8.217637522 | 0.18 |
| 8.220697419222223 | 0.16 |
| 8.223762038972222 | 0.14 |
| 8.226822491777778 | 0.15 |
| 8.229889889444443 | 0.15 |
| 8.2329581205 | 0.17 |
| 8.236021073472223 | 0.16 |
| 8.239080970722222 | 0.16 |
| 8.242140867944444 | 0.16 |
| 8.245200487388889 | 0.18 |
| 8.248261218 | 0.18 |
| 8.25133000463889 | 0.17 |
| 8.254394624388889 | 0.18 |
| 8.257457577361112 | 0.2 |
| 8.260520252527778 | 0.19 |
| 8.263583761083334 | 0.19 |
| 8.266645325083333 | 0.17 |
| 8.269710778194444 | 0.18 |
| 8.272771786611111 | 0.16 |
| 8.275833906194444 | 0.17 |
| 8.278893525638889 | 0.17 |
| 8.281952867277777 | 0.19 |
| 8.28501193113889 | 0.2 |
| 8.288073217361111 | 0.17 |
| 8.291132836805556 | 0.19 |
| 8.294193567416666 | 0.16 |
| 8.297254853611111 | 0.17 |
| 8.300314195277778 | 0.18 |
| 8.303379648388889 | 0.18 |
| 8.306439267833333 | 0.18 |
| 8.309498887277778 | 0.16 |
| 8.312559617888889 | 0.18 |
| 8.315618959555556 | 0.18 |
| 8.318678301194446 | 0.19 |
| 8.32174180975 | 0.19 |
| 8.324808374027779 | 0.18 |
| 8.32786966025 | 0.19 |
| 8.33093983586111 | 0.19 |
| 8.333998899694445 | 0.18 |
| 8.337059908111112 | 0.18 |
| 8.340123416666666 | 0.18 |
| 8.343182480527778 | 0.2 |
| 8.346247378055555 | 0.21 |
| 8.3493069975 | 0.21 |
| 8.352368839305555 | 0.19 |
| 8.355428736527779 | 0.18 |
| 8.358488355972222 | 0.19 |
| 8.361557698194446 | 0.19 |
| 8.36462120675 | 0.2 |
| 8.367682492972222 | 0.19 |
| 8.370742112416666 | 0.18 |
| 8.373803120833333 | 0.2 |
| 8.376863295861112 | 0.2 |
| 8.379923193083332 | 0.19 |
| 8.3829842015 | 0.16 |
| 8.386046043305555 | 0.18 |
| 8.389109829638889 | 0.16 |
| 8.392169449083333 | 0.18 |
| 8.395229901916666 | 0.18 |
| 8.398289243583333 | 0.17 |
| 8.401351363166667 | 0.16 |
| 8.404415982888889 | 0.15 |
| 8.407482824972222 | 0.14 |
| 8.410542166611112 | 0.15 |
| 8.413601508277777 | 0.14 |
| 8.416662516694444 | 0.18 |
| 8.419721858333334 | 0.16 |
| 8.422783977916668 | 0.16 |
| 8.425844152944444 | 0.16 |
| 8.4289076615 | 0.17 |
| 8.431968392138888 | 0.16 |
| 8.4350307895 | 0.16 |
| 8.438091797916666 | 0.17 |
| 8.441166696027778 | 0.17 |
| 8.444230760166667 | 0.17 |
| 8.447290935194445 | 0.15 |
| 8.450351388027778 | 0.18 |
| 8.453412952027778 | 0.16 |
| 8.456473960444445 | 0.16 |
| 8.4595408025 | 0.16 |
| 8.462600977555555 | 0.14 |
| 8.465660319194445 | 0.13 |
| 8.468720494222222 | 0.16 |
| 8.471780113666666 | 0.13 |
| 8.474847233555556 | 0.15 |
| 8.477910186527778 | 0.12 |
| 8.480975361833334 | 0.09 |
| 8.484039425972222 | 0.12 |
| 8.48710043438889 | 0.12 |
| 8.490160331638888 | 0.11 |
| 8.493220506666667 | 0.13 |
| 8.496286515361112 | 0.13 |
| 8.4993505795 | 0.13 |
| 8.50241131011111 | 0.12 |
| 8.505472318527778 | 0.09 |
| 8.508533882527777 | 0.11 |
| 8.511594890944444 | 0.08 |
| 8.51465506597222 | 0.08 |
| 8.517715518805556 | 0.08 |
| 8.520777082805555 | 0.1 |
| 8.523837257833334 | 0.07 |
| 8.526899655222222 | 0.07 |
| 8.529967608472221 | 0.09 |
| 8.533032228194445 | 0.09 |
| 8.536092681027778 | 0.08 |
| 8.539153411638889 | 0.09 |
| 8.542213864472222 | 0.12 |
| 8.545275706277778 | 0.11 |
| 8.548337270277777 | 0.11 |
| 8.551409668222222 | 0.12 |
| 8.554473732361112 | 0.12 |
| 8.557533351805555 | 0.14 |
| 8.56060324961111 | 0.13 |
| 8.563669813916666 | 0.15 |
| 8.566729155555555 | 0.12 |
| 8.569790719555556 | 0.14 |
| 8.572850616805555 | 0.16 |
| 8.575912736388888 | 0.15 |
| 8.578975133777778 | 0.14 |
| 8.582041142472223 | 0.15 |
| 8.585104651027777 | 0.15 |
| 8.58816538163889 | 0.13 |
| 8.591230279166668 | 0.11 |
| 8.594292954333334 | 0.13 |
| 8.59735618511111 | 0.12 |
| 8.600416082333334 | 0.12 |
| 8.603475979583333 | 0.14 |
| 8.606546432972221 | 0.16 |
| 8.609606330222222 | 0.16 |
| 8.612666783027779 | 0.15 |
| 8.615729736 | 0.15 |
| 8.618788799861111 | 0.13 |
| 8.621850086083333 | 0.13 |
| 8.624913872416666 | 0.15 |
| 8.62797432525 | 0.15 |
| 8.631036167055555 | 0.14 |
| 8.634095508694443 | 0.13 |
| 8.637155961527778 | 0.14 |
| 8.640220025666666 | 0.15 |
| 8.64328686775 | 0.18 |
| 8.646351765277778 | 0.16 |
| 8.649412218083334 | 0.14 |
| 8.6524826715 | 0.15 |
| 8.65554201313889 | 0.15 |
| 8.658606355083334 | 0.14 |
| 8.66166653011111 | 0.14 |
| 8.66472642736111 | 0.15 |
| 8.667792436055556 | 0.15 |
| 8.670852333277777 | 0.12 |
| 8.673911952722221 | 0.14 |
| 8.676971572166668 | 0.13 |
| 8.680033136166667 | 0.13 |
| 8.683093033416666 | 0.14 |
| 8.68615598638889 | 0.13 |
| 8.689216994805555 | 0.13 |
| 8.692287448194444 | 0.13 |
| 8.695349012194445 | 0.13 |
| 8.698415576472222 | 0.11 |
| 8.701479362833334 | 0.12 |
| 8.704539815666667 | 0.11 |
| 8.707599990694444 | 0.13 |
| 8.710660165722222 | 0.13 |
| 8.713743675416668 | 0.12 |
| 8.716808295138888 | 0.13 |
| 8.719868192388889 | 0.14 |
| 8.722927534027777 | 0.13 |
| 8.725987153472222 | 0.13 |
| 8.729052884388889 | 0.12 |
| 8.732111948250001 | 0.12 |
| 8.735172678861112 | 0.14 |
| 8.738234520666667 | 0.11 |
| 8.741299695972222 | 0.13 |
| 8.744358759833334 | 0.14 |
| 8.74742365736111 | 0.12 |
| 8.750484110194444 | 0.14 |
| 8.753556785944443 | 0.14 |
| 8.756618349944445 | 0.13 |
| 8.759686580972222 | 0.13 |
| 8.762745644833334 | 0.11 |
| 8.7658130425 | 0.11 |
| 8.76887293975 | 0.12 |
| 8.77194255975 | 0.15 |
| 8.775003568166667 | 0.15 |
| 8.778062909833334 | 0.12 |
| 8.781124751611111 | 0.11 |
| 8.784191315916667 | 0.13 |
| 8.7872534355 | 0.13 |
| 8.790322499916668 | 0.11 |
| 8.793381841583333 | 0.12 |
| 8.796443127777778 | 0.11 |
| 8.799503025027777 | 0.1 |
| 8.802567089166667 | 0.1 |
| 8.80562920875 | 0.11 |
| 8.808699939944445 | 0.12 |
| 8.811763170694444 | 0.09 |
| 8.81487029286111 | 0.1 |
| 8.817929912305555 | 0.1 |
| 8.820991476305554 | 0.11 |
| 8.82405192913889 | 0.11 |
| 8.827114604305555 | 0.1 |
| 8.830175057138888 | 0.11 |
| 8.833243565972221 | 0.11 |
| 8.836305129972223 | 0.12 |
| 8.839380861444445 | 0.12 |
| 8.84244048088889 | 0.11 |
| 8.845502878277777 | 0.09 |
| 8.848570275944445 | 0.08 |
| 8.851629339805555 | 0.09 |
| 8.854697015277777 | 0.08 |
| 8.85776385736111 | 0.08 |
| 8.860823754583333 | 0.07 |
| 8.863887263138889 | 0.07 |
| 8.866948827138888 | 0.09 |
| 8.870012057916668 | 0.07 |
| 8.873071399555554 | 0.07 |
| 8.876131574583333 | 0.09 |
| 8.879191194027777 | 0.08 |
| 8.88225164686111 | 0.07 |
| 8.8853109885 | 0.09 |
| 8.888371441333334 | 0.11 |
| 8.891431338583333 | 0.11 |
| 8.894497625055555 | 0.11 |
| 8.897580023583334 | 0.11 |
| 8.900654088305556 | 0.11 |
| 8.90371370775 | 0.12 |
| 8.906773327194445 | 0.12 |
| 8.90983683575 | 0.13 |
| 8.912899510916667 | 0.15 |
| 8.915961352722222 | 0.15 |
| 8.919022638916667 | 0.14 |
| 8.922081980583334 | 0.11 |
| 8.925145766916666 | 0.11 |
| 8.928206497555555 | 0.11 |
| 8.931268617138889 | 0.12 |
| 8.934329069972222 | 0.12 |
| 8.937389522777778 | 0.14 |
| 8.940449975611111 | 0.13 |
| 8.943509595055556 | 0.11 |
| 8.946572548027778 | 0.11 |
| 8.949646334944445 | 0.11 |
| 8.952723455388888 | 0.11 |
| 8.955783908222221 | 0.09 |
| 8.958844916638888 | 0.11 |
| 8.961908425194444 | 0.12 |
| 8.964967766833333 | 0.12 |
| 8.968032664361111 | 0.11 |
| 8.971096450722222 | 0.12 |
| 8.974159681472221 | 0.1 |
| 8.977220967694445 | 0.12 |
| 8.980287531972222 | 0.13 |
| 8.983349651555555 | 0.13 |
| 8.986410659972222 | 0.12 |
| 8.989470279416667 | 0.12 |
| 8.992531565611111 | 0.13 |
| 8.995594796388888 | 0.14 |
| 8.998654693611112 | 0.13 |
| 9.001714868638889 | 0.12 |
| 9.004775321472222 | 0.13 |
| 9.007834940916666 | 0.13 |
| 9.010900116250001 | 0.12 |
| 9.013961124666666 | 0.09 |
| 9.017022688666668 | 0.11 |
| 9.02008230811111 | 0.11 |
| 9.023146094444444 | 0.11 |
| 9.026206547277777 | 0.11 |
| 9.029270611416667 | 0.1 |
| 9.032331619833334 | 0.13 |
| 9.035394017222222 | 0.1 |
| 9.03845335886111 | 0.12 |
| 9.041517978583334 | 0.11 |
| 9.04457815363889 | 0.13 |
| 9.047656107444444 | 0.13 |
| 9.050720171583333 | 0.12 |
| 9.053779791027779 | 0.13 |
| 9.056840799444444 | 0.11 |
| 9.059904863583334 | 0.13 |
| 9.062966427583333 | 0.11 |
| 9.066026047027778 | 0.12 |
| 9.069087611027777 | 0.12 |
| 9.072149175055555 | 0.14 |
| 9.075209627861112 | 0.13 |
| 9.078272303055556 | 0.09 |
| 9.081333033666667 | 0.13 |
| 9.084400986916668 | 0.11 |
| 9.087464217666668 | 0.1 |
| 9.090537449 | 0.12 |
| 9.093604846666667 | 0.12 |
| 9.09666752186111 | 0.11 |
| 9.099727141305555 | 0.12 |
| 9.102793427805556 | 0.13 |
| 9.105853047250001 | 0.1 |
| 9.108913222277778 | 0.12 |
| 9.1119731195 | 0.11 |
| 9.115033294527779 | 0.12 |
| 9.118097914277778 | 0.11 |
| 9.121161978416666 | 0.08 |
| 9.124222153444446 | 0.12 |
| 9.127289273333334 | 0.12 |
| 9.130352781888888 | 0.12 |
| 9.13341434588889 | 0.13 |
| 9.136478687805557 | 0.15 |
| 9.139539140638888 | 0.14 |
| 9.142601260222222 | 0.12 |
| 9.14567115802778 | 0.12 |
| 9.148732999833333 | 0.08 |
| 9.151800953083333 | 0.11 |
| 9.154861405916666 | 0.1 |
| 9.157921025361112 | 0.1 |
| 9.16098342275 | 0.1 |
| 9.164042764388888 | 0.12 |
| 9.16710266163889 | 0.1 |
| 9.17016200327778 | 0.11 |
| 9.173221622722222 | 0.08 |
| 9.176284853472223 | 0.08 |
| 9.179349195416668 | 0.07 |
| 9.182409926027779 | 0.07 |
| 9.185469267694446 | 0.11 |
| 9.188529164916666 | 0.08 |
| 9.191589617750001 | 0.08 |
| 9.194651459555555 | 0.07 |
| 9.197726913222223 | 0.09 |
| 9.200786532666667 | 0.09 |
| 9.203851430194446 | 0.11 |
| 9.206912438611111 | 0.12 |
| 9.209972613638888 | 0.11 |
| 9.213032788666666 | 0.09 |
| 9.21609407488889 | 0.09 |
| 9.219156472277778 | 0.1 |
| 9.222216647305556 | 0.12 |
| 9.225279600277778 | 0.12 |
| 9.228345608972223 | 0.12 |
| 9.231411895472222 | 0.13 |
| 9.234473459472223 | 0.12 |
| 9.237533078916666 | 0.12 |
| 9.240595754083333 | 0.1 |
| 9.243654817944444 | 0.11 |
| 9.246714159583332 | 0.11 |
| 9.249782668416668 | 0.1 |
| 9.252842010083334 | 0.11 |
| 9.255904963055556 | 0.1 |
| 9.258967638222222 | 0.11 |
| 9.26202781325 | 0.11 |
| 9.265097711055557 | 0.09 |
| 9.268162330805556 | 0.11 |
| 9.271228895083334 | 0.09 |
| 9.274292125833332 | 0.07 |
| 9.277358134555556 | 0.09 |
| 9.280434699416668 | 0.12 |
| 9.283496541194443 | 0.12 |
| 9.286558383000001 | 0.12 |
| 9.289618280222223 | 0.12 |
| 9.292677899666668 | 0.13 |
| 9.295741963805556 | 0.12 |
| 9.298801861055555 | 0.13 |
| 9.301863980638888 | 0.13 |
| 9.30492554463889 | 0.1 |
| 9.307985719666668 | 0.13 |
| 9.311057562055556 | 0.1 |
| 9.314118570444446 | 0.13 |
| 9.317179856666666 | 0.13 |
| 9.320239476111112 | 0.13 |
| 9.323307984944444 | 0.11 |
| 9.326372882472223 | 0.12 |
| 9.329432501916665 | 0.12 |
| 9.332502121944446 | 0.13 |
| 9.335563408138889 | 0.12 |
| 9.338626083305556 | 0.13 |
| 9.341693203194446 | 0.1 |
| 9.344752822638888 | 0.13 |
| 9.347815497805556 | 0.13 |
| 9.350875395055555 | 0.12 |
| 9.353943626083334 | 0.12 |
| 9.357006579055556 | 0.13 |
| 9.360070087611112 | 0.09 |
| 9.363133318388888 | 0.09 |
| 9.366195160166667 | 0.1 |
| 9.369254501833334 | 0.13 |
| 9.372315232444445 | 0.1 |
| 9.375377074249998 | 0.12 |
| 9.378439749416666 | 0.12 |
| 9.381509369444444 | 0.11 |
| 9.384569266666666 | 0.11 |
| 9.38763055288889 | 0.09 |
| 9.39069850613889 | 0.1 |
| 9.393760347916666 | 0.09 |
| 9.396820522972222 | 0.12 |
| 9.399880697999999 | 0.11 |
| 9.402940039638889 | 0.1 |
| 9.405999659083335 | 0.09 |
| 9.409062889861112 | 0.09 |
| 9.412122787083334 | 0.09 |
| 9.41518629563889 | 0.07 |
| 9.418246192888889 | 0.08 |
| 9.421308868055556 | 0.1 |
| 9.4243684875 | 0.07 |
| 9.427430329305555 | 0.09 |
| 9.430489948750001 | 0.09 |
| 9.433554012888889 | 0.07 |
| 9.436614743500002 | 0.05 |
| 9.439675751916667 | 0.08 |
| 9.442736482527778 | 0.06 |
| 9.445795824194445 | 0.07 |
| 9.448859610527776 | 0.06 |
| 9.451927008194444 | 0.07 |
| 9.454987738833333 | 0.06 |
| 9.458068192777777 | 0.07 |
| 9.461128090027778 | 0.03 |
| 9.46418854286111 | 0.05 |
| 9.467252606999999 | 0.05 |
| 9.470319726861112 | 0.05 |
| 9.473379068527779 | 0.04 |
| 9.4764420215 | 0.06 |
| 9.479501363138889 | 0.07 |
| 9.48256431611111 | 0.07 |
| 9.485623935555555 | 0.06 |
| 9.488686610722223 | 0.07 |
| 9.491751230472223 | 0.08 |
| 9.494810572111112 | 0.1 |
| 9.497871580527777 | 0.07 |
| 9.500949256555556 | 0.07 |
| 9.504008875999999 | 0.07 |
| 9.507074051333333 | 0.08 |
| 9.5101367265 | 0.07 |
| 9.51320384636111 | 0.09 |
| 9.516264299194445 | 0.08 |
| 9.51932530761111 | 0.1 |
| 9.52238464925 | 0.11 |
| 9.52544371311111 | 0.1 |
| 9.528513055333333 | 0.11 |
| 9.531578786250002 | 0.08 |
| 9.534645628333335 | 0.11 |
| 9.537708303499999 | 0.09 |
| 9.540777367916666 | 0.13 |
| 9.543839765305556 | 0.13 |
| 9.546898829166668 | 0.13 |
| 9.549958448611111 | 0.11 |
| 9.553017790277778 | 0.11 |
| 9.55608657688889 | 0.1 |
| 9.559147307527779 | 0.12 |
| 9.562207482555555 | 0.13 |
| 9.565268490972223 | 0.11 |
| 9.568330332750001 | 0.11 |
| 9.571391341166667 | 0.12 |
| 9.574454294138889 | 0.11 |
| 9.577513635777777 | 0.12 |
| 9.580577144333333 | 0.12 |
| 9.583642041861111 | 0.13 |
| 9.586701383527778 | 0.11 |
| 9.589762391944445 | 0.12 |
| 9.592823122555556 | 0.12 |
| 9.595885519944444 | 0.12 |
| 9.598948472916666 | 0.11 |
| 9.602011425861111 | 0.12 |
| 9.605072989861112 | 0.12 |
| 9.608137331805557 | 0.12 |
| 9.611198895805556 | 0.11 |
| 9.614260459805555 | 0.09 |
| 9.617319523666668 | 0.1 |
| 9.620378865333334 | 0.13 |
| 9.623443485055555 | 0.11 |
| 9.626503382277777 | 0.1 |
| 9.6295646685 | 0.11 |
| 9.632630677194445 | 0.11 |
| 9.635690018833332 | 0.11 |
| 9.638757138722223 | 0.09 |
| 9.64181731375 | 0.11 |
| 9.644881933472222 | 0.1 |
| 9.647943497472223 | 0.09 |
| 9.651003394722222 | 0.08 |
| 9.654063291972221 | 0.06 |
| 9.657123189194444 | 0.06 |
| 9.660183642027778 | 0.06 |
| 9.663244928222221 | 0.05 |
| 9.666307881194445 | 0.06 |
| 9.669367778444444 | 0.06 |
| 9.67242739788889 | 0.06 |
| 9.675493128777777 | 0.07 |
| 9.678555526166665 | 0.08 |
| 9.681626812944444 | 0.06 |
| 9.68468865475 | 0.07 |
| 9.687753830055556 | 0.08 |
| 9.690817060833334 | 0.06 |
| 9.693891403333334 | 0.08 |
| 9.696951022777778 | 0.12 |
| 9.700014253527778 | 0.09 |
| 9.703080540027777 | 0.12 |
| 9.706184328666668 | 0.13 |
| 9.70925756 | 0.11 |
| 9.71231690163889 | 0.09 |
| 9.71537985461111 | 0.09 |
| 9.71843975186111 | 0.08 |
| 9.721505760555555 | 0.09 |
| 9.724569546916666 | 0.09 |
| 9.727633055472221 | 0.11 |
| 9.730693508277778 | 0.08 |
| 9.733762572722222 | 0.09 |
| 9.736824970111112 | 0.11 |
| 9.739887923055555 | 0.09 |
| 9.7429475425 | 0.11 |
| 9.746007717555555 | 0.07 |
| 9.749068170361111 | 0.06 |
| 9.752136401416667 | 0.07 |
| 9.755197409833333 | 0.08 |
| 9.758267863222223 | 0.06 |
| 9.761328038250001 | 0.06 |
| 9.764405992083333 | 0.06 |
| 9.7674670005 | 0.07 |
| 9.770528842305556 | 0.06 |
| 9.77359735113889 | 0.08 |
| 9.776691139194446 | 0.07 |
| 9.779754369972222 | 0.05 |
| 9.782814544999999 | 0.05 |
| 9.78587472002778 | 0.07 |
| 9.788942117694443 | 0.08 |
| 9.792013960055556 | 0.06 |
| 9.795076357444444 | 0.07 |
| 9.798147088638888 | 0.05 |
| 9.80121004161111 | 0.06 |
| 9.80428994 | 0.05 |
| 9.807369560583334 | 0.06 |
| 9.810429180027779 | 0.04 |
| 9.81348991063889 | 0.05 |
| 9.81655064125 | 0.03 |
| 9.81963665111111 | 0.01 |
| 9.822698770694444 | 0.02 |
| 9.825758667916666 | 0.03 |
| 9.828819120750001 | 0.02 |
| 9.831879295777778 | 0.03 |
| 9.834941693166666 | 0.06 |
| 9.838002146000001 | 0.07 |
| 9.841070654833333 | 0.06 |
| 9.844130829861111 | 0.08 |
| 9.847202394444444 | 0.07 |
| 9.850267291972221 | 0.06 |
| 9.853326911416667 | 0.07 |
| 9.85639069775 | 0.08 |
| 9.859452817333333 | 0.08 |
| 9.8625168815 | 0.09 |
| 9.865577889888888 | 0.09 |
| 9.868638342722223 | 0.1 |
| 9.871702684666666 | 0.09 |
| 9.87476397086111 | 0.12 |
| 9.877823590305555 | 0.12 |
| 9.88088376536111 | 0.11 |
| 9.883950329638889 | 0.11 |
| 9.887010782472222 | 0.08 |
| 9.890089291861111 | 0.09 |
| 9.893148911305556 | 0.11 |
| 9.89620991972222 | 0.11 |
| 9.899269816972222 | 0.1 |
| 9.902329992 | 0.11 |
| 9.905389333666667 | 0.11 |
| 9.908449786472223 | 0.09 |
| 9.911522184444445 | 0.09 |
| 9.914583192833332 | 0.08 |
| 9.91764892375 | 0.1 |
| 9.920710765555555 | 0.08 |
| 9.92377205175 | 0.08 |
| 9.926835004722221 | 0.09 |
| 9.929901569 | 0.09 |
| 9.93297646711111 | 0.07 |
| 9.93604053125 | 0.09 |
| 9.939100706277777 | 0.09 |
| 9.942170604083332 | 0.08 |
| 9.945233001472223 | 0.11 |
| 9.948292065333334 | 0.1 |
| 9.951353351527779 | 0.09 |
| 9.954415193333334 | 0.09 |
| 9.957512592722223 | 0.11 |
| 9.960576656861111 | 0.09 |
| 9.963641276583335 | 0.11 |
| 9.966701729416666 | 0.09 |
| 9.969764126777779 | 0.11 |
| 9.972826246388887 | 0.12 |
| 9.9758916995 | 0.1 |
| 9.978952152305556 | 0.1 |
| 9.982013438527778 | 0.11 |
| 9.985073891361111 | 0.11 |
| 9.988136566527778 | 0.1 |
| 9.991213686972221 | 0.11 |
| 9.994276917722223 | 0.09 |
| 9.99733764836111 | 0.11 |
| 10.000403934833333 | 0.1 |
| 10.003467165611111 | 0.09 |
| 10.00652734063889 | 0.07 |
| 10.00958723788889 | 0.1 |
| 10.012652135388889 | 0.07 |
| 10.015713977194444 | 0.08 |
| 10.018774430027777 | 0.11 |
| 10.021844605611111 | 0.1 |
| 10.02490533625 | 0.1 |
| 10.027965511277777 | 0.1 |
| 10.031028186444445 | 0.1 |
| 10.034088639277778 | 0.11 |
| 10.037161037222223 | 0.11 |
| 10.040220934472222 | 0.09 |
| 10.04328027611111 | 0.09 |
| 10.046339895555555 | 0.09 |
| 10.04940340411111 | 0.09 |
| 10.052466634888889 | 0.08 |
| 10.055530976805555 | 0.08 |
| 10.05859142963889 | 0.08 |
| 10.061651604666666 | 0.08 |
| 10.064712613083332 | 0.08 |
| 10.067771954749999 | 0.06 |
| 10.070831851972223 | 0.09 |
| 10.073893415972222 | 0.08 |
| 10.076953590999999 | 0.08 |
| 10.08001821075 | 0.08 |
| 10.083078107972224 | 0.08 |
| 10.086140227555555 | 0.08 |
| 10.089200402611112 | 0.09 |
| 10.092263633361112 | 0.09 |
| 10.095323808388889 | 0.1 |
| 10.098399262083333 | 0.1 |
| 10.101463326222222 | 0.08 |
| 10.104524056833332 | 0.08 |
| 10.107583120694445 | 0.07 |
| 10.110642184555555 | 0.09 |
| 10.113710137805556 | 0.09 |
| 10.116770312833333 | 0.07 |
| 10.119830210083334 | 0.06 |
| 10.12289371863889 | 0.07 |
| 10.12596472761111 | 0.07 |
| 10.129024624861112 | 0.09 |
| 10.132093689277777 | 0.07 |
| 10.135155253277777 | 0.05 |
| 10.138214872722221 | 0.06 |
| 10.141277547916665 | 0.06 |
| 10.14434216763889 | 0.07 |
| 10.14740206488889 | 0.06 |
| 10.15046196211111 | 0.05 |
| 10.15352213713889 | 0.03 |
| 10.156582589972222 | 0.04 |
| 10.159644153972222 | 0.05 |
| 10.162704051222223 | 0.05 |
| 10.165770893305556 | 0.05 |
| 10.1688321795 | 0.05 |
| 10.171891243361111 | 0.06 |
| 10.174961418972222 | 0.05 |
| 10.178021316194444 | 0.04 |
| 10.181086491527777 | 0.05 |
| 10.18414638875 | 0.05 |
| 10.187207397166667 | 0.07 |
| 10.190270072333332 | 0.06 |
| 10.193330247388888 | 0.07 |
| 10.196394033722223 | 0.07 |
| 10.19945337538889 | 0.09 |
| 10.202517439527778 | 0.08 |
| 10.20557900352778 | 0.12 |
| 10.208639178555556 | 0.11 |
| 10.211699631388887 | 0.13 |
| 10.214763417722223 | 0.13 |
| 10.217824148333333 | 0.14 |
| 10.220885990138887 | 0.12 |
| 10.223945331777777 | 0.12 |
| 10.227006617999999 | 0.12 |
| 10.230067626416666 | 0.12 |
| 10.233130857166666 | 0.12 |
| 10.236192698972223 | 0.11 |
| 10.2392750975 | 0.1 |
| 10.24233443913889 | 0.11 |
| 10.245401003416665 | 0.08 |
| 10.24846117847222 | 0.1 |
| 10.251524131444445 | 0.09 |
| 10.254593195861112 | 0.11 |
| 10.257652815305555 | 0.07 |
| 10.260724657666668 | 0.09 |
| 10.26379066636111 | 0.08 |
| 10.266850563611111 | 0.09 |
| 10.26990990525 | 0.09 |
| 10.272970358083334 | 0.08 |
| 10.276029977527777 | 0.07 |
| 10.27909515286111 | 0.09 |
| 10.282155883472221 | 0.11 |
| 10.285217169666666 | 0.12 |
| 10.288276233527778 | 0.11 |
| 10.291339464305555 | 0.1 |
| 10.294400472694445 | 0.12 |
| 10.29745981436111 | 0.11 |
| 10.300519711583332 | 0.12 |
| 10.303579886638888 | 0.11 |
| 10.3066470065 | 0.11 |
| 10.309706070361111 | 0.09 |
| 10.312772912444444 | 0.1 |
| 10.31583336527778 | 0.1 |
| 10.318892984722222 | 0.1 |
| 10.32195399311111 | 0.1 |
| 10.325035836055557 | 0.12 |
| 10.328095177722222 | 0.13 |
| 10.331157852888888 | 0.14 |
| 10.334223306 | 0.12 |
| 10.337282369861112 | 0.14 |
| 10.3403417115 | 0.12 |
| 10.34340160875 | 0.12 |
| 10.346463450527779 | 0.13 |
| 10.349526681305557 | 0.12 |
| 10.352586578527777 | 0.13 |
| 10.355646197972224 | 0.12 |
| 10.358713873444445 | 0.13 |
| 10.361776270833333 | 0.15 |
| 10.36483727925 | 0.13 |
| 10.367899121027778 | 0.14 |
| 10.370960962833333 | 0.12 |
| 10.374029193888889 | 0.12 |
| 10.377095480361112 | 0.12 |
| 10.380160655694445 | 0.11 |
| 10.383221941888888 | 0.13 |
| 10.3862826725 | 0.12 |
| 10.389345903277778 | 0.11 |
| 10.392407467277778 | 0.12 |
| 10.395467920111113 | 0.1 |
| 10.398528372916667 | 0.11 |
| 10.401587992361112 | 0.1 |
| 10.404648445194445 | 0.09 |
| 10.407707786833333 | 0.08 |
| 10.410769628638889 | 0.11 |
| 10.413829525888888 | 0.11 |
| 10.416889700916666 | 0.09 |
| 10.419949875944443 | 0.11 |
| 10.42300949538889 | 0.09 |
| 10.426070226 | 0.08 |
| 10.429137345888888 | 0.07 |
| 10.4321980765 | 0.09 |
| 10.435257418138889 | 0.08 |
| 10.438320093333333 | 0.09 |
| 10.441383879666667 | 0.1 |
| 10.444446277055556 | 0.09 |
| 10.447509230027778 | 0.09 |
| 10.45056912727778 | 0.07 |
| 10.453630691277779 | 0.11 |
| 10.456700311277778 | 0.08 |
| 10.459772153638887 | 0.11 |
| 10.46283427322222 | 0.08 |
| 10.465897226194445 | 0.09 |
| 10.468959068 | 0.07 |
| 10.472018409638888 | 0.1 |
| 10.47507830688889 | 0.09 |
| 10.478144037805555 | 0.08 |
| 10.481205879583333 | 0.08 |
| 10.484265499027778 | 0.07 |
| 10.487325396277779 | 0.07 |
| 10.490385571305556 | 0.08 |
| 10.493447413083333 | 0.07 |
| 10.496507865916668 | 0.08 |
| 10.49956915213889 | 0.09 |
| 10.50262988275 | 0.08 |
| 10.50568922438889 | 0.07 |
| 10.508749399416667 | 0.08 |
| 10.511815130333334 | 0.09 |
| 10.51488475036111 | 0.08 |
| 10.517946036555555 | 0.11 |
| 10.521007878361111 | 0.11 |
| 10.524067775583333 | 0.12 |
| 10.527127672833334 | 0.1 |
| 10.530187292277777 | 0.12 |
| 10.533248856277776 | 0.1 |
| 10.536309031305557 | 0.11 |
| 10.5393703175 | 0.11 |
| 10.542436603999999 | 0.11 |
| 10.545499556972223 | 0.1 |
| 10.548559732000001 | 0.12 |
| 10.551619073666668 | 0.12 |
| 10.554680915444443 | 0.13 |
| 10.557741646083333 | 0.12 |
| 10.560803765666666 | 0.13 |
| 10.563863385111112 | 0.16 |
| 10.566930227194446 | 0.14 |
| 10.56999068 | 0.13 |
| 10.573057244305556 | 0.12 |
| 10.576118530499999 | 0.07 |
| 10.579177872166666 | 0.09 |
| 10.58223776938889 | 0.09 |
| 10.5852985 | 0.09 |
| 10.588357841666667 | 0.1 |
| 10.591422183611112 | 0.08 |
| 10.594487636722222 | 0.09 |
| 10.597547256166665 | 0.09 |
| 10.60060632 | 0.09 |
| 10.603676217833332 | 0.08 |
| 10.606735559472222 | 0.05 |
| 10.609797401277778 | 0.06 |
| 10.612858409666666 | 0.06 |
| 10.615918862500001 | 0.07 |
| 10.6189804265 | 0.07 |
| 10.62204115713889 | 0.06 |
| 10.625103554499999 | 0.05 |
| 10.628166507472223 | 0.06 |
| 10.631225849138888 | 0.06 |
| 10.634286579749999 | 0.05 |
| 10.637351477277777 | 0.05 |
| 10.640412763472222 | 0.04 |
| 10.643472382916668 | 0.04 |
| 10.646542002944445 | 0.04 |
| 10.649606067083335 | 0.05 |
| 10.652667353277778 | 0.05 |
| 10.655726694944445 | 0.05 |
| 10.65879437038889 | 0.04 |
| 10.661861490277778 | 0.06 |
| 10.664934443805555 | 0.05 |
| 10.668001563694444 | 0.06 |
| 10.671067294583334 | 0.06 |
| 10.674128303 | 0.06 |
| 10.677187644666667 | 0.07 |
| 10.680248097472223 | 0.07 |
| 10.683309105888888 | 0.06 |
| 10.686368447555557 | 0.07 |
| 10.689428067 | 0.08 |
| 10.692489908777778 | 0.07 |
| 10.695549250444445 | 0.09 |
| 10.698616092527779 | 0.11 |
| 10.701675711972223 | 0.12 |
| 10.704736164777778 | 0.11 |
| 10.707806895972222 | 0.11 |
| 10.710868182194444 | 0.1 |
| 10.713928357222223 | 0.08 |
| 10.716988254444445 | 0.08 |
| 10.72004787388889 | 0.09 |
| 10.723108048944445 | 0.07 |
| 10.72616933513889 | 0.1 |
| 10.72922923238889 | 0.09 |
| 10.732293574305556 | 0.1 |
| 10.735352915972223 | 0.09 |
| 10.738412535416666 | 0.1 |
| 10.741472988222222 | 0.11 |
| 10.744532885472221 | 0.1 |
| 10.747602783277777 | 0.08 |
| 10.750665180666665 | 0.09 |
| 10.753728411416667 | 0.09 |
| 10.756794975722222 | 0.09 |
| 10.759857928694444 | 0.08 |
| 10.762923937388889 | 0.08 |
| 10.765988279305557 | 0.07 |
| 10.769065121972222 | 0.08 |
| 10.772129741694444 | 0.09 |
| 10.775193805833332 | 0.08 |
| 10.77825564763889 | 0.07 |
| 10.781319433999998 | 0.07 |
| 10.784378775638888 | 0.08 |
| 10.787438117277777 | 0.05 |
| 10.790498014527778 | 0.06 |
| 10.793559300722222 | 0.04 |
| 10.796619753555555 | 0.06 |
| 10.799679372999998 | 0.08 |
| 10.80273927025 | 0.07 |
| 10.805800000861112 | 0.06 |
| 10.808866287361111 | 0.08 |
| 10.81193757413889 | 0.05 |
| 10.814999693722223 | 0.07 |
| 10.818060424333334 | 0.05 |
| 10.821126433027779 | 0.06 |
| 10.824186330277778 | 0.05 |
| 10.827282340694445 | 0.05 |
| 10.830341682333334 | 0.02 |
| 10.83340269075 | 0.04 |
| 10.836468143861111 | 0.07 |
| 10.839538041666666 | 0.05 |
| 10.84259932788889 | 0.06 |
| 10.845661725277777 | 0.07 |
| 10.848731345277779 | 0.07 |
| 10.85179040913889 | 0.07 |
| 10.854850584166666 | 0.07 |
| 10.857910203611112 | 0.07 |
| 10.860973156583334 | 0.08 |
| 10.864033609416666 | 0.06 |
| 10.867092951055556 | 0.05 |
| 10.870154792861111 | 0.04 |
| 10.873215245694444 | 0.05 |
| 10.876274865138889 | 0.06 |
| 10.879335873555556 | 0.06 |
| 10.882396326361112 | 0.06 |
| 10.885455668027777 | 0.06 |
| 10.88851778761111 | 0.06 |
| 10.89158435188889 | 0.04 |
| 10.8946450825 | 0.05 |
| 10.897715535916666 | 0.05 |
| 10.900782377999999 | 0.07 |
| 10.903842275222223 | 0.05 |
| 10.90690939511111 | 0.05 |
| 10.909970125722221 | 0.05 |
| 10.91302946736111 | 0.05 |
| 10.91609103136111 | 0.07 |
| 10.919152317583332 | 0.07 |
| 10.922213603777777 | 0.06 |
| 10.92527655675 | 0.05 |
| 10.928337842972223 | 0.06 |
| 10.931400240333332 | 0.06 |
| 10.934463748888888 | 0.04 |
| 10.937528646416668 | 0.04 |
| 10.940589654833333 | 0.03 |
| 10.94365233 | 0.05 |
| 10.94671222725 | 0.04 |
| 10.949772402277778 | 0.04 |
| 10.952831743944444 | 0.06 |
| 10.955893585722222 | 0.07 |
| 10.958974317500001 | 0.05 |
| 10.962035048111112 | 0.06 |
| 10.965094667555556 | 0.06 |
| 10.968163176388888 | 0.07 |
| 10.971222795833334 | 0.08 |
| 10.974283526472224 | 0.11 |
| 10.977345090472223 | 0.11 |
| 10.980408599027777 | 0.12 |
| 10.983468218472222 | 0.12 |
| 10.986528115694444 | 0.09 |
| 10.989589124111111 | 0.12 |
| 10.992651521500001 | 0.11 |
| 10.99571086313889 | 0.11 |
| 10.998772704944445 | 0.09 |
| 11.001832602166667 | 0.08 |
| 11.004892221611112 | 0.09 |
| 11.007951841055554 | 0.08 |
| 11.011015071833333 | 0.08 |
| 11.014078302583334 | 0.09 |
| 11.017142366722222 | 0.09 |
| 11.020206986472221 | 0.09 |
| 11.02326799488889 | 0.1 |
| 11.026328169916667 | 0.1 |
| 11.029399734472223 | 0.09 |
| 11.032458798333332 | 0.07 |
| 11.0355214735 | 0.07 |
| 11.03858609325 | 0.07 |
| 11.041648212833334 | 0.07 |
| 11.044709499027778 | 0.06 |
| 11.04777217422222 | 0.07 |
| 11.050832904833333 | 0.04 |
| 11.053894468833334 | 0.04 |
| 11.05695547725 | 0.08 |
| 11.060021208138888 | 0.04 |
| 11.063081383194444 | 0.06 |
| 11.06614489175 | 0.05 |
| 11.069206177944444 | 0.05 |
| 11.072268297527778 | 0.07 |
| 11.075329861527777 | 0.07 |
| 11.078390869944444 | 0.07 |
| 11.081458267611112 | 0.06 |
| 11.084517609277777 | 0.05 |
| 11.087577228722223 | 0.04 |
| 11.090637125944443 | 0.03 |
| 11.093700912305556 | 0.07 |
| 11.096769698944446 | 0.06 |
| 11.099831818527779 | 0.04 |
| 11.102900605166667 | 0.06 |
| 11.105962169166666 | 0.07 |
| 11.109028733444445 | 0.07 |
| 11.112093353166665 | 0.07 |
| 11.115156028361111 | 0.05 |
| 11.118215647805554 | 0.08 |
| 11.121274989444444 | 0.07 |
| 11.12433544227778 | 0.09 |
| 11.127399784194445 | 0.11 |
| 11.130467459666667 | 0.08 |
| 11.133529579249998 | 0.09 |
| 11.136590865472222 | 0.08 |
| 11.13965826313889 | 0.09 |
| 11.142718160361111 | 0.1 |
| 11.145782224500001 | 0.1 |
| 11.148843510722221 | 0.09 |
| 11.15190507472222 | 0.1 |
| 11.154969694444445 | 0.11 |
| 11.158032925222223 | 0.08 |
| 11.161098378333334 | 0.09 |
| 11.16416272025 | 0.11 |
| 11.167223450888889 | 0.11 |
| 11.170291681916666 | 0.1 |
| 11.173353245916665 | 0.08 |
| 11.176420921388889 | 0.1 |
| 11.179481374222222 | 0.09 |
| 11.182542660416667 | 0.12 |
| 11.185608946916666 | 0.07 |
| 11.1886710665 | 0.08 |
| 11.19173013036111 | 0.06 |
| 11.194796139055555 | 0.07 |
| 11.197857147472224 | 0.07 |
| 11.200922322777778 | 0.06 |
| 11.20398194222222 | 0.05 |
| 11.207047395333332 | 0.05 |
| 11.210108125972221 | 0.05 |
| 11.213176634805556 | 0.07 |
| 11.216236532055554 | 0.08 |
| 11.219305318694444 | 0.09 |
| 11.222368549444445 | 0.09 |
| 11.225431502416667 | 0.08 |
| 11.228496955527778 | 0.08 |
| 11.231600744166666 | 0.08 |
| 11.23466036361111 | 0.08 |
| 11.237723872166665 | 0.09 |
| 11.240787102916666 | 0.07 |
| 11.24385616736111 | 0.08 |
| 11.246915786805555 | 0.08 |
| 11.249975128444445 | 0.06 |
| 11.253038081416667 | 0.08 |
| 11.25610575688889 | 0.09 |
| 11.259170098805555 | 0.09 |
| 11.262250552777779 | 0.1 |
| 11.265312672361112 | 0.09 |
| 11.268389237222221 | 0.1 |
| 11.271454412555556 | 0.08 |
| 11.274519310083335 | 0.09 |
| 11.27761143138889 | 0.1 |
| 11.280674384333333 | 0.08 |
| 11.283759005222223 | 0.08 |
| 11.286818902472222 | 0.09 |
| 11.289884355583332 | 0.09 |
| 11.292947308527777 | 0.11 |
| 11.296018039722224 | 0.09 |
| 11.299087104166667 | 0.09 |
| 11.302148112583334 | 0.09 |
| 11.305219954944445 | 0.08 |
| 11.308280129972223 | 0.07 |
| 11.311339749416666 | 0.08 |
| 11.314406313694445 | 0.08 |
| 11.31746593313889 | 0.08 |
| 11.320528052722223 | 0.08 |
| 11.323605450972224 | 0.09 |
| 11.326664792638889 | 0.09 |
| 11.329724967666667 | 0.06 |
| 11.332786809444444 | 0.08 |
| 11.335849206833334 | 0.08 |
| 11.338911882 | 0.09 |
| 11.34197177925 | 0.09 |
| 11.345031676472223 | 0.08 |
| 11.348101574305556 | 0.08 |
| 11.351160915944444 | 0.09 |
| 11.35422109097222 | 0.09 |
| 11.357281543805556 | 0.1 |
| 11.36034116325 | 0.09 |
| 11.363457452611112 | 0.09 |
| 11.366523461305555 | 0.11 |
| 11.369584191916665 | 0.08 |
| 11.372645200333334 | 0.06 |
| 11.37570620875 | 0.07 |
| 11.378769995083335 | 0.06 |
| 11.38183017013889 | 0.06 |
| 11.38489173413889 | 0.05 |
| 11.387951075777778 | 0.04 |
| 11.39101402875 | 0.04 |
| 11.394073648194444 | 0.05 |
| 11.397173825500001 | 0.06 |
| 11.400238723027778 | 0.05 |
| 11.403300287027777 | 0.06 |
| 11.40636073986111 | 0.04 |
| 11.409427859722223 | 0.04 |
| 11.412491646083332 | 0.05 |
| 11.415556265805556 | 0.09 |
| 11.418618385416666 | 0.06 |
| 11.421686338666667 | 0.07 |
| 11.424750680583333 | 0.06 |
| 11.427811688999999 | 0.08 |
| 11.430872141833333 | 0.08 |
| 11.433934261416667 | 0.11 |
| 11.436999714527778 | 0.08 |
| 11.440061278527777 | 0.09 |
| 11.443121175777778 | 0.09 |
| 11.446182184194445 | 0.09 |
| 11.449245970527778 | 0.07 |
| 11.452310590277778 | 0.06 |
| 11.455373543222223 | 0.07 |
| 11.4584495525 | 0.09 |
| 11.461514450027778 | 0.08 |
| 11.464579625361111 | 0.11 |
| 11.467639244805556 | 0.09 |
| 11.470700253194446 | 0.08 |
| 11.473760706027777 | 0.06 |
| 11.476821714444444 | 0.05 |
| 11.479899112694444 | 0.06 |
| 11.482961787861111 | 0.05 |
| 11.486027240972222 | 0.07 |
| 11.489102139055555 | 0.05 |
| 11.49216231411111 | 0.07 |
| 11.495222211333335 | 0.07 |
| 11.49829683163889 | 0.07 |
| 11.501357006666666 | 0.07 |
| 11.50441995963889 | 0.09 |
| 11.507481801444444 | 0.08 |
| 11.510552254833332 | 0.05 |
| 11.513617430138888 | 0.08 |
| 11.516677327388889 | 0.07 |
| 11.519746947416667 | 0.08 |
| 11.522807678027778 | 0.08 |
| 11.525878687 | 0.08 |
| 11.528941084388888 | 0.07 |
| 11.53200014825 | 0.08 |
| 11.53506199002778 | 0.1 |
| 11.538124387416667 | 0.1 |
| 11.541184562444444 | 0.11 |
| 11.544245848666668 | 0.12 |
| 11.547306023694444 | 0.13 |
| 11.550365643138889 | 0.12 |
| 11.553424984777777 | 0.11 |
| 11.55648404863889 | 0.12 |
| 11.559544223666668 | 0.09 |
| 11.562606065472222 | 0.11 |
| 11.56566707388889 | 0.11 |
| 11.568728360083332 | 0.09 |
| 11.571791313055556 | 0.07 |
| 11.5748509325 | 0.07 |
| 11.577914441055556 | 0.07 |
| 11.580977671833335 | 0.08 |
| 11.584036735694445 | 0.06 |
| 11.587104966722222 | 0.06 |
| 11.590166252944444 | 0.06 |
| 11.593231428249998 | 0.07 |
| 11.596292436666667 | 0.07 |
| 11.599352333916666 | 0.09 |
| 11.602414453500002 | 0.09 |
| 11.60547685086111 | 0.1 |
| 11.608536192527778 | 0.1 |
| 11.611595534166668 | 0.1 |
| 11.614657375972222 | 0.11 |
| 11.617717550999998 | 0.11 |
| 11.620778559416667 | 0.12 |
| 11.623838456666666 | 0.14 |
| 11.626899187277777 | 0.13 |
| 11.629963529222223 | 0.12 |
| 11.633024259833334 | 0.13 |
| 11.636084434861111 | 0.15 |
| 11.63915488825 | 0.12 |
| 11.642216730055557 | 0.14 |
| 11.645281905361111 | 0.13 |
| 11.648348469666667 | 0.09 |
| 11.651410311444446 | 0.1 |
| 11.654471597666666 | 0.12 |
| 11.657531772694444 | 0.12 |
| 11.660591114333332 | 0.12 |
| 11.663651567166667 | 0.09 |
| 11.666717020277778 | 0.12 |
| 11.669780251027777 | 0.1 |
| 11.672841815027779 | 0.11 |
| 11.675901156694444 | 0.09 |
| 11.678961609527779 | 0.11 |
| 11.682021228972221 | 0.11 |
| 11.685084459722223 | 0.09 |
| 11.688145468138888 | 0.09 |
| 11.691205365388889 | 0.11 |
| 11.694267207166668 | 0.09 |
| 11.697327937777779 | 0.09 |
| 11.700387279444444 | 0.09 |
| 11.703450788 | 0.11 |
| 11.706510407444444 | 0.09 |
| 11.709589472444444 | 0.08 |
| 11.712650480861111 | 0.09 |
| 11.715711211472222 | 0.06 |
| 11.718770553138889 | 0.08 |
| 11.72183045036111 | 0.07 |
| 11.724900348166665 | 0.08 |
| 11.727966079083334 | 0.08 |
| 11.731028476472222 | 0.07 |
| 11.734093373972222 | 0.09 |
| 11.737153826805557 | 0.1 |
| 11.740216779777779 | 0.11 |
| 11.74328223288889 | 0.08 |
| 11.746343519111111 | 0.06 |
| 11.74940369413889 | 0.07 |
| 11.752464146944444 | 0.1 |
| 11.755523210805556 | 0.08 |
| 11.758583941444446 | 0.1 |
| 11.761648838944444 | 0.09 |
| 11.76470818061111 | 0.06 |
| 11.76776835563889 | 0.06 |
| 11.770832419777777 | 0.05 |
| 11.77389287261111 | 0.06 |
| 11.776953881027778 | 0.06 |
| 11.780017389583334 | 0.02 |
| 11.78308089813889 | 0.02 |
| 11.786145517861112 | 0.02 |
| 11.789205137305556 | 0.01 |
| 11.792264756749999 | 0 |
| 11.795328265305555 | -0.02 |
| 11.798391496083333 | 0.01 |
| 11.801454726833333 | -0.01 |
| 11.80451573525 | -0.02 |
| 11.80757646586111 | -0.04 |
| 11.810636918694444 | -0.03 |
| 11.813700982833334 | -0.02 |
| 11.816761435666667 | -0.02 |
| 11.819825221999999 | -0.01 |
| 11.822893730861113 | 0 |
| 11.825953628083333 | 0.01 |
| 11.829016303277777 | 0 |
| 11.832077589472222 | 0 |
| 11.835138597888887 | 0 |
| 11.83820071747222 | 0.03 |
| 11.84126394825 | -0.01 |
| 11.844323845472223 | -0.05 |
| 11.847384576083334 | -0.05 |
| 11.85045280713889 | -0.06 |
| 11.853512148805557 | -0.03 |
| 11.856577601916667 | -0.03 |
| 11.859636943555556 | -0.01 |
| 11.862703785638889 | -0.02 |
| 11.865767016388888 | 0 |
| 11.868826358055555 | -0.01 |
| 11.8718940335 | -0.05 |
| 11.87495865325 | -0.05 |
| 11.878019106055557 | -0.04 |
| 11.881082059027777 | -0.03 |
| 11.884145845388888 | -0.03 |
| 11.887205187027778 | -0.05 |
| 11.890265362055555 | -0.05 |
| 11.893327481666667 | -0.05 |
| 11.896386823305555 | -0.03 |
| 11.899453109805554 | -0.05 |
| 11.902512451444444 | -0.06 |
| 11.905572626472221 | -0.11 |
| 11.908632523722222 | -0.09 |
| 11.911691865361112 | -0.06 |
| 11.914751207027779 | -0.06 |
| 11.91781499336111 | -0.09 |
| 11.920875168416666 | -0.09 |
| 11.92394145488889 | -0.1 |
| 11.927004407861112 | -0.14 |
| 11.930065138472223 | -0.15 |
| 11.933128091444445 | -0.17 |
| 11.936190211027778 | -0.19 |
| 11.939258164305556 | -0.19 |
| 11.942322228444443 | -0.19 |
| 11.945381292305555 | -0.21 |
| 11.948444800861111 | -0.21 |
| 11.951504698083333 | -0.2 |
| 11.954569595611112 | -0.21 |
| 11.957628937277779 | -0.22 |
| 11.960692445833335 | -0.22 |
| 11.963752065277777 | -0.21 |
| 11.966811684722222 | -0.23 |
| 11.969874082083333 | -0.23 |
| 11.972934534916666 | -0.22 |
| 11.975995543333333 | -0.22 |
| 11.979055162777778 | -0.23 |
| 11.982116726777777 | -0.22 |
| 11.985183291055556 | -0.21 |
| 11.988242632722223 | -0.22 |
| 11.991303085527777 | -0.24 |
| 11.994363260583333 | -0.22 |
| 11.997425380166666 | -0.23 |
| 12.000487777527779 | -0.23 |
| 12.003553508444444 | -0.27 |
| 12.006613961277779 | -0.26 |
| 12.00967941438889 | -0.28 |
| 12.01273931161111 | -0.27 |
| 12.015806153694443 | -0.27 |
| 12.018867717694443 | -0.25 |
| 12.021942893583333 | -0.27 |
| 12.025004179805556 | -0.26 |
| 12.028066577166667 | -0.29 |
| 12.031129530138887 | -0.31 |
| 12.034189427388888 | -0.29 |
| 12.037250713583333 | -0.28 |
| 12.040313110972221 | -0.29 |
| 12.043376897333333 | -0.28 |
| 12.046444294999999 | -0.28 |
| 12.04950502561111 | -0.29 |
| 12.052566867416667 | -0.29 |
| 12.055630653749999 | -0.29 |
| 12.058698329222223 | -0.29 |
| 12.061759059833333 | -0.28 |
| 12.06482479075 | -0.3 |
| 12.067885521361111 | -0.32 |
| 12.070947640944445 | -0.32 |
| 12.074015316416666 | -0.33 |
| 12.077076324833333 | -0.35 |
| 12.080142611305556 | -0.34 |
| 12.083205008694444 | -0.33 |
| 12.086268795055556 | -0.35 |
| 12.089332303611112 | -0.35 |
| 12.092403034805555 | -0.35 |
| 12.095462932027777 | -0.35 |
| 12.098522273694444 | -0.35 |
| 12.101583004305555 | -0.35 |
| 12.10464262375 | -0.36 |
| 12.10770835463889 | -0.35 |
| 12.110769085277779 | -0.37 |
| 12.113851483805556 | -0.35 |
| 12.116910825444446 | -0.39 |
| 12.119976000777777 | -0.38 |
| 12.123040620500001 | -0.37 |
| 12.126106629194446 | -0.36 |
| 12.129166804222223 | -0.35 |
| 12.132227812638888 | -0.36 |
| 12.13528854325 | -0.38 |
| 12.138352885194443 | -0.38 |
| 12.14142111625 | -0.39 |
| 12.144480180111112 | -0.37 |
| 12.14754174411111 | -0.38 |
| 12.150611641916667 | -0.38 |
| 12.15367709502778 | -0.38 |
| 12.156736436666666 | -0.4 |
| 12.15979911186111 | -0.4 |
| 12.162859842472221 | -0.38 |
| 12.165924462194445 | -0.38 |
| 12.169000749277778 | -0.39 |
| 12.172062313277777 | -0.36 |
| 12.175128877555556 | -0.36 |
| 12.178190441555556 | -0.37 |
| 12.181253116722223 | -0.34 |
| 12.18431245838889 | -0.36 |
| 12.187371800027776 | -0.35 |
| 12.190433641833334 | -0.35 |
| 12.193499094944444 | -0.38 |
| 12.196569548333333 | -0.37 |
| 12.199631945722222 | -0.37 |
| 12.202691565166667 | -0.36 |
| 12.205755629305555 | -0.38 |
| 12.208816359916666 | -0.39 |
| 12.211890980222222 | -0.37 |
| 12.214952822027778 | -0.36 |
| 12.218019386305556 | -0.38 |
| 12.221085395 | -0.39 |
| 12.224149459138888 | -0.38 |
| 12.227211300944445 | -0.37 |
| 12.230272031555556 | -0.37 |
| 12.233332206583333 | -0.35 |
| 12.236393215 | -0.35 |
| 12.239457001361112 | -0.35 |
| 12.242518287555557 | -0.37 |
| 12.245578740388888 | -0.39 |
| 12.248638082027778 | -0.39 |
| 12.251698257055555 | -0.4 |
| 12.254763710194444 | -0.37 |
| 12.257823607416666 | -0.38 |
| 12.260883226861111 | -0.38 |
| 12.263947568805555 | -0.38 |
| 12.267009966194445 | -0.38 |
| 12.270069863416667 | -0.39 |
| 12.273131983 | -0.39 |
| 12.276192991416666 | -0.4 |
| 12.27925427763889 | -0.39 |
| 12.28231750838889 | -0.37 |
| 12.285379072388888 | -0.38 |
| 12.288438414027777 | -0.39 |
| 12.291512200972223 | -0.37 |
| 12.294572376 | -0.35 |
| 12.297643662777777 | -0.38 |
| 12.300702726638889 | -0.36 |
| 12.303762346083333 | -0.37 |
| 12.306822243305556 | -0.34 |
| 12.309883251722221 | -0.32 |
| 12.31294259338889 | -0.32 |
| 12.316020269416667 | -0.34 |
| 12.319080444444444 | -0.33 |
| 12.322140619472222 | -0.34 |
| 12.325202183472223 | -0.33 |
| 12.32826541425 | -0.34 |
| 12.331325311472222 | -0.35 |
| 12.334386319888889 | -0.37 |
| 12.337450661833333 | -0.36 |
| 12.34051167025 | -0.32 |
| 12.343580179083332 | -0.33 |
| 12.346642298666666 | -0.33 |
| 12.34970830736111 | -0.33 |
| 12.352767649027777 | -0.33 |
| 12.35583226875 | -0.33 |
| 12.358892999361112 | -0.33 |
| 12.361953452194443 | -0.32 |
| 12.365013349444444 | -0.33 |
| 12.368073246666667 | -0.33 |
| 12.371133421694445 | -0.34 |
| 12.3742033195 | -0.34 |
| 12.377265161305555 | -0.36 |
| 12.380325058555556 | -0.37 |
| 12.383392734000001 | -0.35 |
| 12.386457631527778 | -0.34 |
| 12.389517250972222 | -0.33 |
| 12.392585759805556 | -0.35 |
| 12.395647323805555 | -0.35 |
| 12.398708054444445 | -0.37 |
| 12.401769618444444 | -0.35 |
| 12.404835904916666 | -0.37 |
| 12.407904413777779 | -0.38 |
| 12.410966811166666 | -0.38 |
| 12.414026430611111 | -0.36 |
| 12.417086883416667 | -0.34 |
| 12.42014733625 | -0.35 |
| 12.423210011416666 | -0.33 |
| 12.426269353083333 | -0.34 |
| 12.429334528388889 | -0.35 |
| 12.432394981222222 | -0.35 |
| 12.43545904536111 | -0.38 |
| 12.438519498194445 | -0.36 |
| 12.441579395416667 | -0.37 |
| 12.44464457075 | -0.37 |
| 12.447728080444445 | -0.39 |
| 12.450791033416667 | -0.4 |
| 12.453857597694446 | -0.38 |
| 12.45693471813889 | -0.43 |
| 12.4599985045 | -0.42 |
| 12.46306645775 | -0.43 |
| 12.466129410722221 | -0.42 |
| 12.469192085888888 | -0.41 |
| 12.472254761055556 | -0.44 |
| 12.475326603444444 | -0.41 |
| 12.478389556416666 | -0.42 |
| 12.481451398194444 | -0.42 |
| 12.48451324 | -0.42 |
| 12.487575637361111 | -0.41 |
| 12.490642479444444 | -0.4 |
| 12.493703487861112 | -0.37 |
| 12.496767829805556 | -0.36 |
| 12.499837172027778 | -0.35 |
| 12.502896513666666 | -0.36 |
| 12.505956688722222 | -0.38 |
| 12.509017141527778 | -0.41 |
| 12.512087872722223 | -0.4 |
| 12.515147492166667 | -0.39 |
| 12.51821183411111 | -0.4 |
| 12.521271731333332 | -0.41 |
| 12.524331073 | -0.4 |
| 12.527390414638889 | -0.4 |
| 12.530451978638888 | -0.4 |
| 12.533512431472223 | -0.42 |
| 12.536572050916666 | -0.42 |
| 12.53963333711111 | -0.41 |
| 12.5426957345 | -0.39 |
| 12.545757854083334 | -0.37 |
| 12.548818306916667 | -0.38 |
| 12.551878481944446 | -0.37 |
| 12.554937823611112 | -0.39 |
| 12.557997443055555 | -0.43 |
| 12.56105734027778 | -0.39 |
| 12.56411779311111 | -0.37 |
| 12.567177412555555 | -0.38 |
| 12.570237032 | -0.39 |
| 12.57329637363889 | -0.38 |
| 12.576358215444444 | -0.36 |
| 12.579418390472222 | -0.37 |
| 12.582483287999999 | -0.39 |
| 12.585550685666666 | -0.38 |
| 12.588610027333333 | -0.38 |
| 12.591674647055555 | -0.37 |
| 12.5947342665 | -0.36 |
| 12.597797497250001 | -0.37 |
| 12.600857672277778 | -0.36 |
| 12.603918125111113 | -0.36 |
| 12.60697830013889 | -0.36 |
| 12.610047920166668 | -0.36 |
| 12.613109206361113 | -0.35 |
| 12.616168548027778 | -0.35 |
| 12.619240112583332 | -0.35 |
| 12.622300843222222 | -0.34 |
| 12.625362685 | -0.34 |
| 12.628425637972223 | -0.37 |
| 12.631484701833333 | -0.35 |
| 12.634547932583333 | -0.34 |
| 12.637607552027779 | -0.33 |
| 12.640668838249999 | -0.33 |
| 12.64373040225 | -0.32 |
| 12.646794744194445 | -0.31 |
| 12.649862141861112 | -0.3 |
| 12.652929817305555 | -0.3 |
| 12.655991936888888 | -0.29 |
| 12.659052389722222 | -0.31 |
| 12.662112842555556 | -0.29 |
| 12.665172184194445 | -0.3 |
| 12.668232359222221 | -0.3 |
| 12.671292534277777 | -0.3 |
| 12.674351875916667 | -0.31 |
| 12.677417051222223 | -0.31 |
| 12.680485282277779 | -0.29 |
| 12.683551290972222 | -0.28 |
| 12.686613132777778 | -0.26 |
| 12.689680252638889 | -0.26 |
| 12.692739872083333 | -0.26 |
| 12.695805603 | -0.27 |
| 12.698866333611111 | -0.29 |
| 12.701934286861112 | -0.28 |
| 12.704997795444445 | -0.26 |
| 12.70805824825 | -0.27 |
| 12.711117312111112 | -0.29 |
| 12.714185543166668 | -0.3 |
| 12.717246829361113 | -0.3 |
| 12.720308393361112 | -0.27 |
| 12.723371346333334 | -0.26 |
| 12.726431799166665 | -0.27 |
| 12.729491418611111 | -0.28 |
| 12.732552427027777 | -0.29 |
| 12.735612046472221 | -0.29 |
| 12.738682777666666 | -0.28 |
| 12.741745452833333 | -0.31 |
| 12.744805072277778 | -0.31 |
| 12.747865802888889 | -0.31 |
| 12.750926255722222 | -0.33 |
| 12.753986152972221 | -0.33 |
| 12.75707521852778 | -0.33 |
| 12.760135115777777 | -0.34 |
| 12.7631997355 | -0.33 |
| 12.76627630036111 | -0.33 |
| 12.769337864361113 | -0.32 |
| 12.77239803938889 | -0.32 |
| 12.775457381055556 | -0.33 |
| 12.77851783386111 | -0.32 |
| 12.781586064916667 | -0.34 |
| 12.784645962166667 | -0.34 |
| 12.7877097485 | -0.35 |
| 12.79077770175 | -0.33 |
| 12.793842877083334 | -0.36 |
| 12.796913330472222 | -0.37 |
| 12.799978505805555 | -0.36 |
| 12.803046459055555 | -0.33 |
| 12.8061141345 | -0.34 |
| 12.809183198944446 | -0.33 |
| 12.812258374833334 | -0.32 |
| 12.815318272055556 | -0.33 |
| 12.818379558277776 | -0.32 |
| 12.8214394555 | -0.33 |
| 12.824510186694445 | -0.3 |
| 12.827569528361112 | -0.3 |
| 12.830630814555557 | -0.31 |
| 12.833694323111112 | -0.31 |
| 12.83675366477778 | -0.3 |
| 12.839814117583334 | -0.29 |
| 12.842877070555554 | -0.29 |
| 12.845946968361112 | -0.29 |
| 12.849011032527779 | -0.3 |
| 12.852072874305554 | -0.3 |
| 12.855138605222223 | -0.33 |
| 12.858199058055556 | -0.33 |
| 12.861260066444444 | -0.32 |
| 12.86431940811111 | -0.33 |
| 12.867383194444445 | -0.31 |
| 12.870444480666666 | -0.31 |
| 12.873510211555555 | -0.3 |
| 12.876573164527777 | -0.3 |
| 12.879632506194444 | -0.31 |
| 12.882698514888888 | -0.3 |
| 12.885776468722222 | -0.31 |
| 12.88883581036111 | -0.3 |
| 12.8918998745 | -0.33 |
| 12.894961994083333 | -0.33 |
| 12.898023280305555 | -0.3 |
| 12.901112623666666 | -0.3 |
| 12.904182799277777 | -0.31 |
| 12.907247418999999 | -0.3 |
| 12.910308149611112 | -0.3 |
| 12.913375547277777 | -0.3 |
| 12.916438222472223 | -0.28 |
| 12.919503397777778 | -0.28 |
| 12.922564684 | -0.28 |
| 12.925625136805557 | -0.3 |
| 12.928698368138889 | -0.29 |
| 12.931761043333333 | -0.3 |
| 12.93482455188889 | -0.29 |
| 12.937885004694445 | -0.3 |
| 12.940946290916667 | -0.3 |
| 12.944008966083333 | -0.3 |
| 12.947069141111111 | -0.32 |
| 12.950134316444444 | -0.33 |
| 12.953195047055557 | -0.35 |
| 12.956269667361111 | -0.34 |
| 12.959354288222222 | -0.33 |
| 12.96241529663889 | -0.32 |
| 12.965478527416668 | -0.31 |
| 12.968543147138888 | -0.31 |
| 12.971606100111112 | -0.32 |
| 12.974665719555556 | -0.31 |
| 12.97773561736111 | -0.33 |
| 12.980794959027778 | -0.34 |
| 12.983855134055554 | -0.32 |
| 12.986921698333333 | -0.33 |
| 12.989981317777778 | -0.32 |
| 12.993046770888888 | -0.35 |
| 12.996115835305556 | -0.33 |
| 12.999187955472221 | -0.34 |
| 13.002248408305556 | -0.33 |
| 13.00532302861111 | -0.32 |
| 13.008382648055557 | -0.33 |
| 13.011443378666668 | -0.34 |
| 13.014510776333335 | -0.34 |
| 13.017577896222223 | -0.34 |
| 13.020640015805556 | -0.31 |
| 13.023711858166665 | -0.35 |
| 13.026781478194444 | -0.34 |
| 13.02984109763889 | -0.34 |
| 13.032902939416665 | -0.33 |
| 13.03597144825 | -0.34 |
| 13.039031623305556 | -0.35 |
| 13.04209374288889 | -0.33 |
| 13.045153640111112 | -0.34 |
| 13.048247705972221 | -0.32 |
| 13.051307603222222 | -0.33 |
| 13.05436777825 | -0.33 |
| 13.057432953555557 | -0.29 |
| 13.060492850805556 | -0.31 |
| 13.063554137 | -0.31 |
| 13.06663153525 | -0.32 |
| 13.069701155277778 | -0.31 |
| 13.072767719555555 | -0.3 |
| 13.075828172388889 | -0.3 |
| 13.078889180805556 | -0.29 |
| 13.08195213375 | -0.27 |
| 13.085012308805556 | -0.28 |
| 13.088071372666667 | -0.27 |
| 13.091142937222221 | -0.3 |
| 13.094202834472222 | -0.29 |
| 13.09727023213889 | -0.29 |
| 13.100358464333333 | -0.29 |
| 13.103422250666666 | -0.32 |
| 13.106488259361111 | -0.33 |
| 13.109553712472223 | -0.33 |
| 13.112619165583334 | -0.31 |
| 13.115685174305556 | -0.32 |
| 13.118744515944444 | -0.31 |
| 13.121806635527777 | -0.29 |
| 13.12486792175 | -0.28 |
| 13.127934208222221 | -0.26 |
| 13.13102355161111 | -0.26 |
| 13.13408456 | -0.26 |
| 13.137157235750001 | -0.26 |
| 13.140222966666666 | -0.27 |
| 13.143289253166667 | -0.28 |
| 13.146356650833333 | -0.26 |
| 13.149426270833333 | -0.24 |
| 13.152516725388889 | -0.23 |
| 13.155577733805554 | -0.24 |
| 13.158640131166667 | -0.24 |
| 13.16170141738889 | -0.23 |
| 13.164763259166666 | -0.22 |
| 13.167832323611112 | -0.22 |
| 13.170894721 | -0.23 |
| 13.173966841138888 | -0.25 |
| 13.177036183361112 | -0.22 |
| 13.18009858075 | -0.22 |
| 13.183160422555554 | -0.22 |
| 13.186220319777778 | -0.24 |
| 13.189282717166668 | -0.24 |
| 13.19234400336111 | -0.23 |
| 13.195404178416666 | -0.22 |
| 13.198465742416667 | -0.22 |
| 13.20152952875 | -0.2 |
| 13.20459025936111 | -0.22 |
| 13.207676547 | -0.21 |
| 13.210741166750001 | -0.22 |
| 13.21382578761111 | -0.23 |
| 13.216886240444445 | -0.23 |
| 13.219948915611111 | -0.23 |
| 13.223010479611112 | -0.24 |
| 13.226071210250002 | -0.2 |
| 13.229135274388888 | -0.22 |
| 13.232197949555555 | -0.22 |
| 13.235260346944445 | -0.22 |
| 13.238320244166665 | -0.22 |
| 13.241380419194446 | -0.21 |
| 13.244440316444443 | -0.23 |
| 13.247502436027776 | -0.22 |
| 13.250571222666666 | -0.23 |
| 13.253633620055556 | -0.24 |
| 13.256698239777776 | -0.22 |
| 13.259757581444445 | -0.23 |
| 13.262817200888888 | -0.22 |
| 13.265876264722221 | -0.22 |
| 13.268936717555555 | -0.22 |
| 13.271996059222221 | -0.21 |
| 13.275059012166668 | -0.18 |
| 13.278122242944445 | -0.17 |
| 13.281187696055555 | -0.16 |
| 13.284247315499998 | -0.16 |
| 13.287307490527779 | -0.17 |
| 13.290369887916667 | -0.21 |
| 13.293430896333332 | -0.18 |
| 13.29649607163889 | -0.16 |
| 13.29957096975 | -0.15 |
| 13.302638922999998 | -0.14 |
| 13.305698264638888 | -0.12 |
| 13.308760939805556 | -0.11 |
| 13.311822781611111 | -0.13 |
| 13.31489240163889 | -0.14 |
| 13.317954243416667 | -0.12 |
| 13.321016918611111 | -0.11 |
| 13.324080982749999 | -0.12 |
| 13.327142546749998 | -0.13 |
| 13.330201888388888 | -0.14 |
| 13.333268452666667 | -0.14 |
| 13.336328349916668 | -0.14 |
| 13.33938796936111 | -0.14 |
| 13.342448699972222 | -0.15 |
| 13.345513875305555 | -0.15 |
| 13.348574883722224 | -0.13 |
| 13.351636169916668 | -0.13 |
| 13.354698567305556 | -0.11 |
| 13.357759297916667 | -0.11 |
| 13.360818917361112 | -0.11 |
| 13.363882703722224 | -0.11 |
| 13.366942045361112 | -0.12 |
| 13.370001387027777 | -0.09 |
| 13.373061839833333 | -0.12 |
| 13.376123126055557 | -0.13 |
| 13.379185523416666 | -0.14 |
| 13.382244587277778 | -0.13 |
| 13.385309762611111 | -0.12 |
| 13.388371882194445 | -0.16 |
| 13.39143316838889 | -0.16 |
| 13.394492510055557 | -0.18 |
| 13.397554074055556 | -0.18 |
| 13.40061536025 | -0.18 |
| 13.40367609088889 | -0.15 |
| 13.406735154722222 | -0.17 |
| 13.409795607555557 | -0.17 |
| 13.412858282722222 | -0.17 |
| 13.415918457777778 | -0.17 |
| 13.418981410722223 | -0.17 |
| 13.422041030166666 | -0.16 |
| 13.42510231638889 | -0.17 |
| 13.4281677695 | -0.16 |
| 13.43122711113889 | -0.16 |
| 13.434288397361112 | -0.17 |
| 13.437348016805556 | -0.17 |
| 13.440407358444444 | -0.19 |
| 13.443469478027778 | -0.2 |
| 13.446532153222224 | -0.18 |
| 13.449592050444444 | -0.2 |
| 13.452653336666666 | -0.19 |
| 13.455713789472224 | -0.16 |
| 13.458775075694444 | -0.17 |
| 13.461848029222221 | -0.14 |
| 13.464915426888888 | -0.15 |
| 13.467974768555555 | -0.18 |
| 13.47103855488889 | -0.17 |
| 13.474098174333333 | -0.21 |
| 13.47715918275 | -0.21 |
| 13.480225747055556 | -0.19 |
| 13.483289255611112 | -0.21 |
| 13.486349708416666 | -0.18 |
| 13.48941266138889 | -0.16 |
| 13.492480336861112 | -0.18 |
| 13.495552179222221 | -0.17 |
| 13.498614576611113 | -0.16 |
| 13.501680585305557 | -0.15 |
| 13.504741593722223 | -0.14 |
| 13.507813436083334 | -0.12 |
| 13.51087361111111 | -0.12 |
| 13.513933230555557 | -0.14 |
| 13.516993127805554 | -0.14 |
| 13.5200591365 | -0.13 |
| 13.52312208947222 | -0.11 |
| 13.526182820083333 | -0.09 |
| 13.529242995111112 | -0.11 |
| 13.5323053925 | -0.12 |
| 13.535365845333333 | -0.11 |
| 13.538425464777779 | -0.1 |
| 13.541491195666666 | -0.09 |
| 13.544552204083333 | -0.09 |
| 13.547626824388889 | -0.12 |
| 13.55068588825 | -0.13 |
| 13.55374745225 | -0.11 |
| 13.556818461222223 | -0.13 |
| 13.559883080972224 | -0.13 |
| 13.562944922749999 | -0.12 |
| 13.566004542194444 | -0.09 |
| 13.569066106194445 | -0.09 |
| 13.572126281222223 | -0.09 |
| 13.575187011861113 | -0.07 |
| 13.578246631305555 | -0.08 |
| 13.581314584555557 | -0.07 |
| 13.584387815888888 | -0.06 |
| 13.587449102083333 | -0.07 |
| 13.59050844375 | -0.07 |
| 13.593587786527777 | -0.06 |
| 13.596649350527779 | -0.08 |
| 13.599710081166666 | -0.08 |
| 13.602769422805554 | -0.06 |
| 13.605829597833333 | -0.06 |
| 13.608893384194445 | -0.07 |
| 13.611953281416667 | -0.08 |
| 13.615016512194444 | -0.09 |
| 13.618088076749999 | -0.07 |
| 13.621151029722222 | -0.08 |
| 13.624217316222223 | -0.09 |
| 13.627287214027778 | -0.08 |
| 13.630349889222222 | -0.06 |
| 13.633410342027778 | -0.05 |
| 13.636471072666668 | -0.07 |
| 13.63953402561111 | -0.11 |
| 13.642595867416667 | -0.09 |
| 13.645682710638889 | -0.08 |
| 13.648744274638888 | -0.09 |
| 13.651809172166665 | -0.07 |
| 13.65487045836111 | -0.08 |
| 13.657930633416667 | -0.11 |
| 13.660991364027778 | -0.09 |
| 13.664054594777777 | -0.12 |
| 13.667114214222222 | -0.13 |
| 13.67017827836111 | -0.12 |
| 13.673240953555556 | -0.11 |
| 13.676300850777778 | -0.11 |
| 13.679361859194444 | -0.11 |
| 13.682421478638888 | -0.09 |
| 13.6854805425 | -0.11 |
| 13.688540717527777 | -0.12 |
| 13.6916036705 | -0.1 |
| 13.694666901277778 | -0.1 |
| 13.697739854805556 | -0.12 |
| 13.700800307638888 | -0.1 |
| 13.703861316055557 | -0.12 |
| 13.706927046944445 | -0.11 |
| 13.709988610944444 | -0.08 |
| 13.713054897444444 | -0.06 |
| 13.71611590586111 | -0.07 |
| 13.719177192055556 | -0.06 |
| 13.722242922972223 | -0.06 |
| 13.725304486972222 | -0.04 |
| 13.728366606555555 | -0.05 |
| 13.731426503805556 | -0.05 |
| 13.734485845444445 | -0.03 |
| 13.737548798416666 | -0.04 |
| 13.740613695944445 | -0.07 |
| 13.74367498213889 | -0.06 |
| 13.746736546138889 | -0.05 |
| 13.749796165583332 | -0.02 |
| 13.752859396361112 | 0 |
| 13.755923738277778 | -0.02 |
| 13.758993913888888 | -0.01 |
| 13.76205686686111 | 0 |
| 13.765118430861111 | 0 |
| 13.768181661638888 | 0 |
| 13.771242947833333 | 0 |
| 13.774304511833332 | 0 |
| 13.777367742583333 | 0.03 |
| 13.780433195694444 | 0.01 |
| 13.783495315305556 | 0.02 |
| 13.786555490333333 | 0.02 |
| 13.789617332111112 | 0.04 |
| 13.79267750713889 | 0.04 |
| 13.795742682472222 | 0.05 |
| 13.798807302194444 | 0.04 |
| 13.801866643861112 | 0.06 |
| 13.8049259855 | 0.06 |
| 13.807987271722222 | 0.08 |
| 13.811050780277776 | 0.07 |
| 13.81411234427778 | 0.07 |
| 13.817175019444445 | 0.07 |
| 13.820235194472223 | 0.06 |
| 13.823296480666666 | 0.05 |
| 13.826358044666668 | 0.06 |
| 13.829421553222224 | 0.06 |
| 13.832482561638889 | 0.07 |
| 13.835545236833333 | 0.08 |
| 13.838605967444446 | 0.07 |